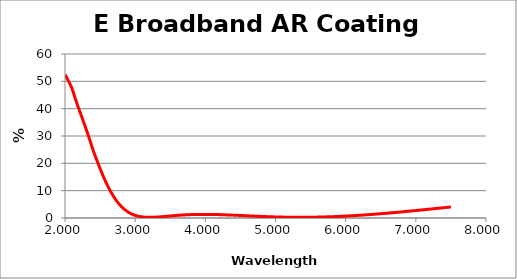
| Category | % Reflectance |
|---|---|
| 2.0 | 52.492 |
| 2.001 | 52.447 |
| 2.002 | 52.402 |
| 2.003 | 52.356 |
| 2.004 | 52.31 |
| 2.005 | 52.271 |
| 2.006 | 52.226 |
| 2.007 | 52.181 |
| 2.008 | 52.136 |
| 2.009 | 52.09 |
| 2.01 | 52.045 |
| 2.011 | 51.999 |
| 2.012 | 51.953 |
| 2.013 | 51.907 |
| 2.014 | 51.861 |
| 2.015 | 51.815 |
| 2.016 | 51.769 |
| 2.017 | 51.722 |
| 2.018 | 51.676 |
| 2.019 | 51.629 |
| 2.02 | 51.582 |
| 2.021 | 51.535 |
| 2.022 | 51.488 |
| 2.023 | 51.441 |
| 2.024 | 51.394 |
| 2.025 | 51.346 |
| 2.026 | 51.298 |
| 2.027 | 51.251 |
| 2.028 | 51.203 |
| 2.029 | 51.155 |
| 2.03 | 51.107 |
| 2.031 | 51.058 |
| 2.032 | 51.01 |
| 2.033 | 50.961 |
| 2.034 | 50.913 |
| 2.035 | 50.864 |
| 2.036 | 50.815 |
| 2.037 | 50.766 |
| 2.038 | 50.716 |
| 2.039 | 50.667 |
| 2.04 | 50.617 |
| 2.041 | 50.568 |
| 2.042 | 50.518 |
| 2.043 | 50.468 |
| 2.044 | 50.418 |
| 2.045 | 50.367 |
| 2.046 | 50.317 |
| 2.047 | 50.266 |
| 2.048 | 50.216 |
| 2.049 | 50.165 |
| 2.05 | 50.114 |
| 2.051 | 50.063 |
| 2.052 | 50.012 |
| 2.053 | 49.96 |
| 2.054 | 49.909 |
| 2.055 | 49.857 |
| 2.056 | 49.805 |
| 2.057 | 49.753 |
| 2.058 | 49.701 |
| 2.059 | 49.648 |
| 2.06 | 49.596 |
| 2.061 | 49.543 |
| 2.062 | 49.491 |
| 2.063 | 49.438 |
| 2.064 | 49.385 |
| 2.065 | 49.332 |
| 2.066 | 49.278 |
| 2.067 | 49.225 |
| 2.068 | 49.171 |
| 2.069 | 49.117 |
| 2.07 | 49.063 |
| 2.071 | 49.009 |
| 2.072 | 48.955 |
| 2.073 | 48.901 |
| 2.074 | 48.846 |
| 2.075 | 48.792 |
| 2.076 | 48.737 |
| 2.077 | 48.682 |
| 2.078 | 48.627 |
| 2.079 | 48.572 |
| 2.08 | 48.516 |
| 2.081 | 48.461 |
| 2.082 | 48.405 |
| 2.083 | 48.349 |
| 2.084 | 48.293 |
| 2.085 | 48.237 |
| 2.086 | 48.181 |
| 2.087 | 48.125 |
| 2.088 | 48.068 |
| 2.089 | 48.012 |
| 2.09 | 47.955 |
| 2.091 | 47.898 |
| 2.092 | 47.841 |
| 2.093 | 47.784 |
| 2.094 | 47.727 |
| 2.095 | 47.669 |
| 2.096 | 47.612 |
| 2.097 | 47.555 |
| 2.098 | 47.498 |
| 2.099 | 47.44 |
| 2.1 | 47.382 |
| 2.101 | 47.324 |
| 2.102 | 47.247 |
| 2.103 | 47.17 |
| 2.104 | 47.093 |
| 2.105 | 47.016 |
| 2.106 | 46.938 |
| 2.107 | 46.86 |
| 2.108 | 46.782 |
| 2.109 | 46.704 |
| 2.11 | 46.626 |
| 2.111 | 46.547 |
| 2.112 | 46.468 |
| 2.113 | 46.389 |
| 2.114 | 46.31 |
| 2.115 | 46.231 |
| 2.116 | 46.152 |
| 2.117 | 46.072 |
| 2.118 | 45.992 |
| 2.119 | 45.912 |
| 2.12 | 45.832 |
| 2.121 | 45.752 |
| 2.122 | 45.671 |
| 2.123 | 45.591 |
| 2.124 | 45.51 |
| 2.125 | 45.429 |
| 2.126 | 45.348 |
| 2.127 | 45.266 |
| 2.128 | 45.185 |
| 2.129 | 45.103 |
| 2.13 | 45.021 |
| 2.131 | 44.939 |
| 2.132 | 44.857 |
| 2.133 | 44.775 |
| 2.134 | 44.692 |
| 2.135 | 44.609 |
| 2.136 | 44.527 |
| 2.137 | 44.444 |
| 2.138 | 44.36 |
| 2.139 | 44.277 |
| 2.14 | 44.194 |
| 2.141 | 44.11 |
| 2.142 | 44.026 |
| 2.143 | 43.942 |
| 2.144 | 43.858 |
| 2.145 | 43.773 |
| 2.146 | 43.689 |
| 2.147 | 43.604 |
| 2.148 | 43.519 |
| 2.149 | 43.434 |
| 2.15 | 43.349 |
| 2.151 | 43.279 |
| 2.152 | 43.208 |
| 2.153 | 43.137 |
| 2.154 | 43.066 |
| 2.155 | 42.995 |
| 2.156 | 42.924 |
| 2.157 | 42.852 |
| 2.158 | 42.781 |
| 2.159 | 42.709 |
| 2.16 | 42.637 |
| 2.161 | 42.565 |
| 2.162 | 42.493 |
| 2.163 | 42.421 |
| 2.164 | 42.349 |
| 2.165 | 42.277 |
| 2.166 | 42.204 |
| 2.167 | 42.132 |
| 2.168 | 42.059 |
| 2.169 | 41.986 |
| 2.17 | 41.913 |
| 2.171 | 41.84 |
| 2.172 | 41.767 |
| 2.173 | 41.694 |
| 2.174 | 41.621 |
| 2.175 | 41.547 |
| 2.176 | 41.473 |
| 2.177 | 41.4 |
| 2.178 | 41.326 |
| 2.179 | 41.252 |
| 2.18 | 41.178 |
| 2.181 | 41.104 |
| 2.182 | 41.03 |
| 2.183 | 40.955 |
| 2.184 | 40.881 |
| 2.185 | 40.806 |
| 2.186 | 40.732 |
| 2.187 | 40.657 |
| 2.188 | 40.582 |
| 2.189 | 40.507 |
| 2.19 | 40.432 |
| 2.191 | 40.357 |
| 2.192 | 40.282 |
| 2.193 | 40.207 |
| 2.194 | 40.131 |
| 2.195 | 40.056 |
| 2.196 | 39.98 |
| 2.197 | 39.904 |
| 2.198 | 39.828 |
| 2.199 | 39.753 |
| 2.2 | 39.677 |
| 2.201 | 39.609 |
| 2.202 | 39.541 |
| 2.203 | 39.473 |
| 2.204 | 39.405 |
| 2.205 | 39.338 |
| 2.206 | 39.269 |
| 2.207 | 39.201 |
| 2.208 | 39.133 |
| 2.209 | 39.065 |
| 2.21 | 38.997 |
| 2.211 | 38.928 |
| 2.212 | 38.86 |
| 2.213 | 38.791 |
| 2.214 | 38.722 |
| 2.215 | 38.654 |
| 2.216 | 38.585 |
| 2.217 | 38.516 |
| 2.218 | 38.446 |
| 2.219 | 38.377 |
| 2.22 | 38.308 |
| 2.221 | 38.238 |
| 2.222 | 38.169 |
| 2.223 | 38.099 |
| 2.224 | 38.029 |
| 2.225 | 37.96 |
| 2.226 | 37.89 |
| 2.227 | 37.82 |
| 2.228 | 37.75 |
| 2.229 | 37.68 |
| 2.23 | 37.61 |
| 2.231 | 37.54 |
| 2.232 | 37.469 |
| 2.233 | 37.399 |
| 2.234 | 37.329 |
| 2.235 | 37.258 |
| 2.236 | 37.188 |
| 2.237 | 37.117 |
| 2.238 | 37.047 |
| 2.239 | 36.976 |
| 2.24 | 36.906 |
| 2.241 | 36.835 |
| 2.242 | 36.764 |
| 2.243 | 36.693 |
| 2.244 | 36.622 |
| 2.245 | 36.551 |
| 2.246 | 36.48 |
| 2.247 | 36.409 |
| 2.248 | 36.338 |
| 2.249 | 36.267 |
| 2.25 | 36.196 |
| 2.251 | 36.124 |
| 2.252 | 36.053 |
| 2.253 | 35.982 |
| 2.254 | 35.91 |
| 2.255 | 35.839 |
| 2.256 | 35.767 |
| 2.257 | 35.695 |
| 2.258 | 35.624 |
| 2.259 | 35.552 |
| 2.26 | 35.48 |
| 2.261 | 35.409 |
| 2.262 | 35.337 |
| 2.263 | 35.265 |
| 2.264 | 35.193 |
| 2.265 | 35.121 |
| 2.266 | 35.049 |
| 2.267 | 34.977 |
| 2.268 | 34.905 |
| 2.269 | 34.833 |
| 2.27 | 34.761 |
| 2.271 | 34.689 |
| 2.272 | 34.616 |
| 2.273 | 34.544 |
| 2.274 | 34.472 |
| 2.275 | 34.399 |
| 2.276 | 34.327 |
| 2.277 | 34.255 |
| 2.278 | 34.182 |
| 2.279 | 34.11 |
| 2.28 | 34.037 |
| 2.281 | 33.965 |
| 2.282 | 33.892 |
| 2.283 | 33.82 |
| 2.284 | 33.747 |
| 2.285 | 33.674 |
| 2.286 | 33.602 |
| 2.287 | 33.529 |
| 2.288 | 33.456 |
| 2.289 | 33.383 |
| 2.29 | 33.311 |
| 2.291 | 33.238 |
| 2.292 | 33.165 |
| 2.293 | 33.092 |
| 2.294 | 33.019 |
| 2.295 | 32.946 |
| 2.296 | 32.874 |
| 2.297 | 32.801 |
| 2.298 | 32.728 |
| 2.299 | 32.655 |
| 2.3 | 32.582 |
| 2.301 | 32.506 |
| 2.302 | 32.431 |
| 2.303 | 32.356 |
| 2.304 | 32.281 |
| 2.305 | 32.205 |
| 2.306 | 32.13 |
| 2.307 | 32.055 |
| 2.308 | 31.979 |
| 2.309 | 31.904 |
| 2.31 | 31.829 |
| 2.311 | 31.753 |
| 2.312 | 31.678 |
| 2.313 | 31.602 |
| 2.314 | 31.527 |
| 2.315 | 31.452 |
| 2.316 | 31.376 |
| 2.317 | 31.301 |
| 2.318 | 31.225 |
| 2.319 | 31.15 |
| 2.32 | 31.074 |
| 2.321 | 30.999 |
| 2.322 | 30.923 |
| 2.323 | 30.848 |
| 2.324 | 30.772 |
| 2.325 | 30.697 |
| 2.326 | 30.622 |
| 2.327 | 30.546 |
| 2.328 | 30.471 |
| 2.329 | 30.395 |
| 2.33 | 30.32 |
| 2.331 | 30.244 |
| 2.332 | 30.169 |
| 2.333 | 30.093 |
| 2.334 | 30.018 |
| 2.335 | 29.942 |
| 2.336 | 29.867 |
| 2.337 | 29.792 |
| 2.338 | 29.716 |
| 2.339 | 29.641 |
| 2.34 | 29.565 |
| 2.341 | 29.49 |
| 2.342 | 29.415 |
| 2.343 | 29.339 |
| 2.344 | 29.264 |
| 2.345 | 29.188 |
| 2.346 | 29.113 |
| 2.347 | 29.038 |
| 2.348 | 28.962 |
| 2.349 | 28.887 |
| 2.35 | 28.812 |
| 2.351 | 28.732 |
| 2.352 | 28.652 |
| 2.353 | 28.572 |
| 2.354 | 28.492 |
| 2.355 | 28.412 |
| 2.356 | 28.333 |
| 2.357 | 28.253 |
| 2.358 | 28.173 |
| 2.359 | 28.093 |
| 2.36 | 28.014 |
| 2.361 | 27.934 |
| 2.362 | 27.854 |
| 2.363 | 27.775 |
| 2.364 | 27.695 |
| 2.365 | 27.615 |
| 2.366 | 27.536 |
| 2.367 | 27.456 |
| 2.368 | 27.377 |
| 2.369 | 27.297 |
| 2.37 | 27.218 |
| 2.371 | 27.139 |
| 2.372 | 27.059 |
| 2.373 | 26.98 |
| 2.374 | 26.901 |
| 2.375 | 26.821 |
| 2.376 | 26.742 |
| 2.377 | 26.663 |
| 2.378 | 26.584 |
| 2.379 | 26.505 |
| 2.38 | 26.426 |
| 2.381 | 26.347 |
| 2.382 | 26.268 |
| 2.383 | 26.189 |
| 2.384 | 26.11 |
| 2.385 | 26.031 |
| 2.386 | 25.953 |
| 2.387 | 25.874 |
| 2.388 | 25.795 |
| 2.389 | 25.717 |
| 2.39 | 25.638 |
| 2.391 | 25.559 |
| 2.392 | 25.481 |
| 2.393 | 25.403 |
| 2.394 | 25.324 |
| 2.395 | 25.246 |
| 2.396 | 25.168 |
| 2.397 | 25.089 |
| 2.398 | 25.011 |
| 2.399 | 24.933 |
| 2.4 | 24.855 |
| 2.401 | 24.784 |
| 2.402 | 24.714 |
| 2.403 | 24.643 |
| 2.404 | 24.572 |
| 2.405 | 24.502 |
| 2.406 | 24.431 |
| 2.407 | 24.361 |
| 2.408 | 24.29 |
| 2.409 | 24.22 |
| 2.41 | 24.149 |
| 2.411 | 24.079 |
| 2.412 | 24.009 |
| 2.413 | 23.939 |
| 2.414 | 23.868 |
| 2.415 | 23.798 |
| 2.416 | 23.728 |
| 2.417 | 23.658 |
| 2.418 | 23.588 |
| 2.419 | 23.519 |
| 2.42 | 23.449 |
| 2.421 | 23.379 |
| 2.422 | 23.309 |
| 2.423 | 23.24 |
| 2.424 | 23.17 |
| 2.425 | 23.101 |
| 2.426 | 23.031 |
| 2.427 | 22.962 |
| 2.428 | 22.893 |
| 2.429 | 22.824 |
| 2.43 | 22.754 |
| 2.431 | 22.685 |
| 2.432 | 22.616 |
| 2.433 | 22.547 |
| 2.434 | 22.478 |
| 2.435 | 22.41 |
| 2.436 | 22.341 |
| 2.437 | 22.272 |
| 2.438 | 22.204 |
| 2.439 | 22.135 |
| 2.44 | 22.067 |
| 2.441 | 21.998 |
| 2.442 | 21.93 |
| 2.443 | 21.862 |
| 2.444 | 21.793 |
| 2.445 | 21.725 |
| 2.446 | 21.657 |
| 2.447 | 21.589 |
| 2.448 | 21.521 |
| 2.449 | 21.454 |
| 2.45 | 21.386 |
| 2.451 | 21.318 |
| 2.452 | 21.251 |
| 2.453 | 21.183 |
| 2.454 | 21.116 |
| 2.455 | 21.048 |
| 2.456 | 20.981 |
| 2.457 | 20.914 |
| 2.458 | 20.847 |
| 2.459 | 20.78 |
| 2.46 | 20.713 |
| 2.461 | 20.646 |
| 2.462 | 20.579 |
| 2.463 | 20.513 |
| 2.464 | 20.446 |
| 2.465 | 20.38 |
| 2.466 | 20.313 |
| 2.467 | 20.247 |
| 2.468 | 20.18 |
| 2.469 | 20.114 |
| 2.47 | 20.048 |
| 2.471 | 19.982 |
| 2.472 | 19.916 |
| 2.473 | 19.85 |
| 2.474 | 19.785 |
| 2.475 | 19.719 |
| 2.476 | 19.653 |
| 2.477 | 19.588 |
| 2.478 | 19.522 |
| 2.479 | 19.457 |
| 2.48 | 19.392 |
| 2.481 | 19.327 |
| 2.482 | 19.262 |
| 2.483 | 19.197 |
| 2.484 | 19.132 |
| 2.485 | 19.067 |
| 2.486 | 19.003 |
| 2.487 | 18.938 |
| 2.488 | 18.874 |
| 2.489 | 18.809 |
| 2.49 | 18.745 |
| 2.491 | 18.681 |
| 2.492 | 18.617 |
| 2.493 | 18.553 |
| 2.494 | 18.489 |
| 2.495 | 18.425 |
| 2.496 | 18.361 |
| 2.497 | 18.298 |
| 2.498 | 18.234 |
| 2.499 | 18.171 |
| 2.5 | 18.107 |
| 2.501 | 18.042 |
| 2.502 | 17.978 |
| 2.503 | 17.913 |
| 2.504 | 17.849 |
| 2.505 | 17.784 |
| 2.506 | 17.72 |
| 2.507 | 17.656 |
| 2.508 | 17.591 |
| 2.509 | 17.527 |
| 2.51 | 17.463 |
| 2.511 | 17.4 |
| 2.512 | 17.336 |
| 2.513 | 17.272 |
| 2.514 | 17.209 |
| 2.515 | 17.146 |
| 2.516 | 17.082 |
| 2.517 | 17.019 |
| 2.518 | 16.956 |
| 2.519 | 16.893 |
| 2.52 | 16.83 |
| 2.521 | 16.768 |
| 2.522 | 16.705 |
| 2.523 | 16.643 |
| 2.524 | 16.58 |
| 2.525 | 16.518 |
| 2.526 | 16.456 |
| 2.527 | 16.394 |
| 2.528 | 16.332 |
| 2.529 | 16.27 |
| 2.53 | 16.209 |
| 2.531 | 16.147 |
| 2.532 | 16.086 |
| 2.533 | 16.024 |
| 2.534 | 15.963 |
| 2.535 | 15.902 |
| 2.536 | 15.841 |
| 2.537 | 15.78 |
| 2.538 | 15.719 |
| 2.539 | 15.659 |
| 2.54 | 15.598 |
| 2.541 | 15.538 |
| 2.542 | 15.478 |
| 2.543 | 15.417 |
| 2.544 | 15.357 |
| 2.545 | 15.298 |
| 2.546 | 15.238 |
| 2.547 | 15.178 |
| 2.548 | 15.118 |
| 2.549 | 15.059 |
| 2.55 | 14.999 |
| 2.551 | 14.94 |
| 2.552 | 14.881 |
| 2.553 | 14.822 |
| 2.554 | 14.763 |
| 2.555 | 14.704 |
| 2.556 | 14.645 |
| 2.557 | 14.587 |
| 2.558 | 14.528 |
| 2.559 | 14.47 |
| 2.56 | 14.412 |
| 2.561 | 14.354 |
| 2.562 | 14.296 |
| 2.563 | 14.238 |
| 2.564 | 14.181 |
| 2.565 | 14.123 |
| 2.566 | 14.066 |
| 2.567 | 14.008 |
| 2.568 | 13.951 |
| 2.569 | 13.894 |
| 2.57 | 13.837 |
| 2.571 | 13.78 |
| 2.572 | 13.724 |
| 2.573 | 13.667 |
| 2.574 | 13.611 |
| 2.575 | 13.554 |
| 2.576 | 13.498 |
| 2.577 | 13.442 |
| 2.578 | 13.386 |
| 2.579 | 13.331 |
| 2.58 | 13.275 |
| 2.581 | 13.219 |
| 2.582 | 13.164 |
| 2.583 | 13.109 |
| 2.584 | 13.054 |
| 2.585 | 12.999 |
| 2.586 | 12.944 |
| 2.587 | 12.889 |
| 2.588 | 12.834 |
| 2.589 | 12.78 |
| 2.59 | 12.726 |
| 2.591 | 12.671 |
| 2.592 | 12.617 |
| 2.593 | 12.563 |
| 2.594 | 12.509 |
| 2.595 | 12.456 |
| 2.596 | 12.402 |
| 2.597 | 12.349 |
| 2.598 | 12.296 |
| 2.599 | 12.242 |
| 2.6 | 12.189 |
| 2.601 | 12.137 |
| 2.602 | 12.084 |
| 2.603 | 12.032 |
| 2.604 | 11.979 |
| 2.605 | 11.927 |
| 2.606 | 11.875 |
| 2.607 | 11.823 |
| 2.608 | 11.772 |
| 2.609 | 11.72 |
| 2.61 | 11.669 |
| 2.611 | 11.617 |
| 2.612 | 11.566 |
| 2.613 | 11.515 |
| 2.614 | 11.464 |
| 2.615 | 11.413 |
| 2.616 | 11.363 |
| 2.617 | 11.312 |
| 2.618 | 11.262 |
| 2.619 | 11.211 |
| 2.62 | 11.161 |
| 2.621 | 11.111 |
| 2.622 | 11.061 |
| 2.623 | 11.012 |
| 2.624 | 10.962 |
| 2.625 | 10.913 |
| 2.626 | 10.863 |
| 2.627 | 10.814 |
| 2.628 | 10.765 |
| 2.629 | 10.716 |
| 2.63 | 10.667 |
| 2.631 | 10.619 |
| 2.632 | 10.57 |
| 2.633 | 10.522 |
| 2.634 | 10.474 |
| 2.635 | 10.425 |
| 2.636 | 10.377 |
| 2.637 | 10.329 |
| 2.638 | 10.282 |
| 2.639 | 10.234 |
| 2.64 | 10.186 |
| 2.641 | 10.139 |
| 2.642 | 10.092 |
| 2.643 | 10.044 |
| 2.644 | 9.997 |
| 2.645 | 9.951 |
| 2.646 | 9.904 |
| 2.647 | 9.857 |
| 2.648 | 9.811 |
| 2.649 | 9.764 |
| 2.65 | 9.718 |
| 2.651 | 9.672 |
| 2.652 | 9.626 |
| 2.653 | 9.58 |
| 2.654 | 9.535 |
| 2.655 | 9.489 |
| 2.656 | 9.444 |
| 2.657 | 9.398 |
| 2.658 | 9.353 |
| 2.659 | 9.308 |
| 2.66 | 9.264 |
| 2.661 | 9.219 |
| 2.662 | 9.174 |
| 2.663 | 9.13 |
| 2.664 | 9.086 |
| 2.665 | 9.041 |
| 2.666 | 8.997 |
| 2.667 | 8.953 |
| 2.668 | 8.91 |
| 2.669 | 8.866 |
| 2.67 | 8.823 |
| 2.671 | 8.779 |
| 2.672 | 8.736 |
| 2.673 | 8.693 |
| 2.674 | 8.65 |
| 2.675 | 8.607 |
| 2.676 | 8.564 |
| 2.677 | 8.522 |
| 2.678 | 8.48 |
| 2.679 | 8.437 |
| 2.68 | 8.395 |
| 2.681 | 8.353 |
| 2.682 | 8.311 |
| 2.683 | 8.27 |
| 2.684 | 8.228 |
| 2.685 | 8.187 |
| 2.686 | 8.145 |
| 2.687 | 8.104 |
| 2.688 | 8.063 |
| 2.689 | 8.022 |
| 2.69 | 7.981 |
| 2.691 | 7.941 |
| 2.692 | 7.9 |
| 2.693 | 7.86 |
| 2.694 | 7.82 |
| 2.695 | 7.78 |
| 2.696 | 7.74 |
| 2.697 | 7.7 |
| 2.698 | 7.66 |
| 2.699 | 7.62 |
| 2.7 | 7.581 |
| 2.701 | 7.542 |
| 2.702 | 7.503 |
| 2.703 | 7.464 |
| 2.704 | 7.425 |
| 2.705 | 7.386 |
| 2.706 | 7.347 |
| 2.707 | 7.309 |
| 2.708 | 7.27 |
| 2.709 | 7.232 |
| 2.71 | 7.194 |
| 2.711 | 7.156 |
| 2.712 | 7.118 |
| 2.713 | 7.081 |
| 2.714 | 7.043 |
| 2.715 | 7.006 |
| 2.716 | 6.968 |
| 2.717 | 6.931 |
| 2.718 | 6.894 |
| 2.719 | 6.857 |
| 2.72 | 6.821 |
| 2.721 | 6.784 |
| 2.722 | 6.747 |
| 2.723 | 6.711 |
| 2.724 | 6.675 |
| 2.725 | 6.639 |
| 2.726 | 6.603 |
| 2.727 | 6.567 |
| 2.728 | 6.531 |
| 2.729 | 6.496 |
| 2.73 | 6.46 |
| 2.731 | 6.425 |
| 2.732 | 6.39 |
| 2.733 | 6.355 |
| 2.734 | 6.32 |
| 2.735 | 6.285 |
| 2.736 | 6.25 |
| 2.737 | 6.216 |
| 2.738 | 6.181 |
| 2.739 | 6.147 |
| 2.74 | 6.113 |
| 2.741 | 6.079 |
| 2.742 | 6.045 |
| 2.743 | 6.011 |
| 2.744 | 5.978 |
| 2.745 | 5.944 |
| 2.746 | 5.911 |
| 2.747 | 5.878 |
| 2.748 | 5.844 |
| 2.749 | 5.811 |
| 2.75 | 5.779 |
| 2.751 | 5.746 |
| 2.752 | 5.713 |
| 2.753 | 5.681 |
| 2.754 | 5.648 |
| 2.755 | 5.616 |
| 2.756 | 5.584 |
| 2.757 | 5.552 |
| 2.758 | 5.52 |
| 2.759 | 5.489 |
| 2.76 | 5.457 |
| 2.761 | 5.425 |
| 2.762 | 5.394 |
| 2.763 | 5.363 |
| 2.764 | 5.332 |
| 2.765 | 5.301 |
| 2.766 | 5.27 |
| 2.767 | 5.239 |
| 2.768 | 5.209 |
| 2.769 | 5.178 |
| 2.77 | 5.148 |
| 2.771 | 5.118 |
| 2.772 | 5.088 |
| 2.773 | 5.058 |
| 2.774 | 5.028 |
| 2.775 | 4.998 |
| 2.776 | 4.968 |
| 2.777 | 4.939 |
| 2.778 | 4.91 |
| 2.779 | 4.88 |
| 2.78 | 4.851 |
| 2.781 | 4.822 |
| 2.782 | 4.793 |
| 2.783 | 4.765 |
| 2.784 | 4.736 |
| 2.785 | 4.707 |
| 2.786 | 4.679 |
| 2.787 | 4.651 |
| 2.788 | 4.623 |
| 2.789 | 4.595 |
| 2.79 | 4.567 |
| 2.791 | 4.539 |
| 2.792 | 4.511 |
| 2.793 | 4.484 |
| 2.794 | 4.456 |
| 2.795 | 4.429 |
| 2.796 | 4.402 |
| 2.797 | 4.375 |
| 2.798 | 4.348 |
| 2.799 | 4.321 |
| 2.8 | 4.294 |
| 2.801 | 4.268 |
| 2.802 | 4.241 |
| 2.803 | 4.215 |
| 2.804 | 4.188 |
| 2.805 | 4.162 |
| 2.806 | 4.136 |
| 2.807 | 4.11 |
| 2.808 | 4.085 |
| 2.809 | 4.059 |
| 2.81 | 4.033 |
| 2.811 | 4.008 |
| 2.812 | 3.983 |
| 2.813 | 3.957 |
| 2.814 | 3.932 |
| 2.815 | 3.907 |
| 2.816 | 3.882 |
| 2.817 | 3.858 |
| 2.818 | 3.833 |
| 2.819 | 3.808 |
| 2.82 | 3.784 |
| 2.821 | 3.76 |
| 2.822 | 3.736 |
| 2.823 | 3.711 |
| 2.824 | 3.687 |
| 2.825 | 3.664 |
| 2.826 | 3.64 |
| 2.827 | 3.616 |
| 2.828 | 3.593 |
| 2.829 | 3.569 |
| 2.83 | 3.546 |
| 2.831 | 3.523 |
| 2.832 | 3.5 |
| 2.833 | 3.477 |
| 2.834 | 3.454 |
| 2.835 | 3.431 |
| 2.836 | 3.408 |
| 2.837 | 3.386 |
| 2.838 | 3.363 |
| 2.839 | 3.341 |
| 2.84 | 3.319 |
| 2.841 | 3.297 |
| 2.842 | 3.275 |
| 2.843 | 3.253 |
| 2.844 | 3.231 |
| 2.845 | 3.209 |
| 2.846 | 3.188 |
| 2.847 | 3.166 |
| 2.848 | 3.145 |
| 2.849 | 3.124 |
| 2.85 | 3.103 |
| 2.851 | 3.081 |
| 2.852 | 3.061 |
| 2.853 | 3.04 |
| 2.854 | 3.019 |
| 2.855 | 2.998 |
| 2.856 | 2.978 |
| 2.857 | 2.957 |
| 2.858 | 2.937 |
| 2.859 | 2.917 |
| 2.86 | 2.897 |
| 2.861 | 2.877 |
| 2.862 | 2.857 |
| 2.863 | 2.837 |
| 2.864 | 2.817 |
| 2.865 | 2.798 |
| 2.866 | 2.778 |
| 2.867 | 2.759 |
| 2.868 | 2.739 |
| 2.869 | 2.72 |
| 2.87 | 2.701 |
| 2.871 | 2.682 |
| 2.872 | 2.663 |
| 2.873 | 2.644 |
| 2.874 | 2.626 |
| 2.875 | 2.607 |
| 2.876 | 2.588 |
| 2.877 | 2.57 |
| 2.878 | 2.552 |
| 2.879 | 2.534 |
| 2.88 | 2.515 |
| 2.881 | 2.497 |
| 2.882 | 2.479 |
| 2.883 | 2.462 |
| 2.884 | 2.444 |
| 2.885 | 2.426 |
| 2.886 | 2.409 |
| 2.887 | 2.391 |
| 2.888 | 2.374 |
| 2.889 | 2.357 |
| 2.89 | 2.339 |
| 2.891 | 2.322 |
| 2.892 | 2.305 |
| 2.893 | 2.288 |
| 2.894 | 2.272 |
| 2.895 | 2.255 |
| 2.896 | 2.238 |
| 2.897 | 2.222 |
| 2.898 | 2.205 |
| 2.899 | 2.189 |
| 2.9 | 2.173 |
| 2.901 | 2.157 |
| 2.902 | 2.141 |
| 2.903 | 2.125 |
| 2.904 | 2.109 |
| 2.905 | 2.093 |
| 2.906 | 2.077 |
| 2.907 | 2.062 |
| 2.908 | 2.046 |
| 2.909 | 2.031 |
| 2.91 | 2.015 |
| 2.911 | 2 |
| 2.912 | 1.985 |
| 2.913 | 1.97 |
| 2.914 | 1.955 |
| 2.915 | 1.94 |
| 2.916 | 1.925 |
| 2.917 | 1.91 |
| 2.918 | 1.896 |
| 2.919 | 1.881 |
| 2.92 | 1.867 |
| 2.921 | 1.852 |
| 2.922 | 1.838 |
| 2.923 | 1.824 |
| 2.924 | 1.81 |
| 2.925 | 1.796 |
| 2.926 | 1.782 |
| 2.927 | 1.768 |
| 2.928 | 1.754 |
| 2.929 | 1.74 |
| 2.93 | 1.726 |
| 2.931 | 1.713 |
| 2.932 | 1.699 |
| 2.933 | 1.686 |
| 2.934 | 1.673 |
| 2.935 | 1.659 |
| 2.936 | 1.646 |
| 2.937 | 1.633 |
| 2.938 | 1.62 |
| 2.939 | 1.607 |
| 2.94 | 1.594 |
| 2.941 | 1.582 |
| 2.942 | 1.569 |
| 2.943 | 1.556 |
| 2.944 | 1.544 |
| 2.945 | 1.531 |
| 2.946 | 1.519 |
| 2.947 | 1.507 |
| 2.948 | 1.494 |
| 2.949 | 1.482 |
| 2.95 | 1.47 |
| 2.951 | 1.458 |
| 2.952 | 1.446 |
| 2.953 | 1.435 |
| 2.954 | 1.423 |
| 2.955 | 1.411 |
| 2.956 | 1.4 |
| 2.957 | 1.388 |
| 2.958 | 1.377 |
| 2.959 | 1.365 |
| 2.96 | 1.354 |
| 2.961 | 1.343 |
| 2.962 | 1.332 |
| 2.963 | 1.321 |
| 2.964 | 1.31 |
| 2.965 | 1.299 |
| 2.966 | 1.288 |
| 2.967 | 1.277 |
| 2.968 | 1.266 |
| 2.969 | 1.256 |
| 2.97 | 1.245 |
| 2.971 | 1.235 |
| 2.972 | 1.224 |
| 2.973 | 1.214 |
| 2.974 | 1.204 |
| 2.975 | 1.194 |
| 2.976 | 1.184 |
| 2.977 | 1.174 |
| 2.978 | 1.164 |
| 2.979 | 1.154 |
| 2.98 | 1.144 |
| 2.981 | 1.134 |
| 2.982 | 1.124 |
| 2.983 | 1.115 |
| 2.984 | 1.105 |
| 2.985 | 1.096 |
| 2.986 | 1.086 |
| 2.987 | 1.077 |
| 2.988 | 1.068 |
| 2.989 | 1.058 |
| 2.99 | 1.049 |
| 2.991 | 1.04 |
| 2.992 | 1.031 |
| 2.993 | 1.022 |
| 2.994 | 1.013 |
| 2.995 | 1.005 |
| 2.996 | 0.996 |
| 2.997 | 0.987 |
| 2.998 | 0.979 |
| 2.999 | 0.97 |
| 3.0 | 0.962 |
| 3.001 | 0.953 |
| 3.002 | 0.945 |
| 3.003 | 0.937 |
| 3.004 | 0.929 |
| 3.005 | 0.921 |
| 3.006 | 0.913 |
| 3.007 | 0.906 |
| 3.008 | 0.898 |
| 3.009 | 0.89 |
| 3.01 | 0.883 |
| 3.011 | 0.875 |
| 3.012 | 0.867 |
| 3.013 | 0.86 |
| 3.014 | 0.853 |
| 3.015 | 0.845 |
| 3.016 | 0.838 |
| 3.017 | 0.831 |
| 3.018 | 0.824 |
| 3.019 | 0.816 |
| 3.02 | 0.809 |
| 3.021 | 0.802 |
| 3.022 | 0.796 |
| 3.023 | 0.789 |
| 3.024 | 0.782 |
| 3.025 | 0.775 |
| 3.026 | 0.768 |
| 3.027 | 0.762 |
| 3.028 | 0.755 |
| 3.029 | 0.748 |
| 3.03 | 0.742 |
| 3.031 | 0.735 |
| 3.032 | 0.729 |
| 3.033 | 0.723 |
| 3.034 | 0.716 |
| 3.035 | 0.71 |
| 3.036 | 0.704 |
| 3.037 | 0.697 |
| 3.038 | 0.691 |
| 3.039 | 0.685 |
| 3.04 | 0.679 |
| 3.041 | 0.673 |
| 3.042 | 0.667 |
| 3.043 | 0.661 |
| 3.044 | 0.656 |
| 3.045 | 0.65 |
| 3.046 | 0.644 |
| 3.047 | 0.639 |
| 3.048 | 0.633 |
| 3.049 | 0.627 |
| 3.05 | 0.622 |
| 3.051 | 0.616 |
| 3.052 | 0.611 |
| 3.053 | 0.606 |
| 3.054 | 0.6 |
| 3.055 | 0.595 |
| 3.056 | 0.59 |
| 3.057 | 0.585 |
| 3.058 | 0.58 |
| 3.059 | 0.574 |
| 3.06 | 0.569 |
| 3.061 | 0.565 |
| 3.062 | 0.56 |
| 3.063 | 0.555 |
| 3.064 | 0.55 |
| 3.065 | 0.545 |
| 3.066 | 0.54 |
| 3.067 | 0.536 |
| 3.068 | 0.531 |
| 3.069 | 0.526 |
| 3.07 | 0.522 |
| 3.071 | 0.517 |
| 3.072 | 0.513 |
| 3.073 | 0.509 |
| 3.074 | 0.504 |
| 3.075 | 0.5 |
| 3.076 | 0.496 |
| 3.077 | 0.491 |
| 3.078 | 0.487 |
| 3.079 | 0.483 |
| 3.08 | 0.479 |
| 3.081 | 0.475 |
| 3.082 | 0.471 |
| 3.083 | 0.467 |
| 3.084 | 0.463 |
| 3.085 | 0.459 |
| 3.086 | 0.455 |
| 3.087 | 0.452 |
| 3.088 | 0.448 |
| 3.089 | 0.444 |
| 3.09 | 0.44 |
| 3.091 | 0.437 |
| 3.092 | 0.433 |
| 3.093 | 0.43 |
| 3.094 | 0.426 |
| 3.095 | 0.423 |
| 3.096 | 0.419 |
| 3.097 | 0.416 |
| 3.098 | 0.413 |
| 3.099 | 0.409 |
| 3.1 | 0.406 |
| 3.101 | 0.403 |
| 3.102 | 0.4 |
| 3.103 | 0.397 |
| 3.104 | 0.393 |
| 3.105 | 0.39 |
| 3.106 | 0.387 |
| 3.107 | 0.384 |
| 3.108 | 0.381 |
| 3.109 | 0.379 |
| 3.11 | 0.376 |
| 3.111 | 0.373 |
| 3.112 | 0.37 |
| 3.113 | 0.367 |
| 3.114 | 0.365 |
| 3.115 | 0.362 |
| 3.116 | 0.359 |
| 3.117 | 0.357 |
| 3.118 | 0.354 |
| 3.119 | 0.352 |
| 3.12 | 0.349 |
| 3.121 | 0.347 |
| 3.122 | 0.344 |
| 3.123 | 0.342 |
| 3.124 | 0.339 |
| 3.125 | 0.337 |
| 3.126 | 0.335 |
| 3.127 | 0.333 |
| 3.128 | 0.33 |
| 3.129 | 0.328 |
| 3.13 | 0.326 |
| 3.131 | 0.324 |
| 3.132 | 0.322 |
| 3.133 | 0.32 |
| 3.134 | 0.318 |
| 3.135 | 0.316 |
| 3.136 | 0.314 |
| 3.137 | 0.312 |
| 3.138 | 0.31 |
| 3.139 | 0.308 |
| 3.14 | 0.307 |
| 3.141 | 0.305 |
| 3.142 | 0.303 |
| 3.143 | 0.301 |
| 3.144 | 0.3 |
| 3.145 | 0.298 |
| 3.146 | 0.296 |
| 3.147 | 0.295 |
| 3.148 | 0.293 |
| 3.149 | 0.292 |
| 3.15 | 0.29 |
| 3.151 | 0.289 |
| 3.152 | 0.287 |
| 3.153 | 0.286 |
| 3.154 | 0.285 |
| 3.155 | 0.283 |
| 3.156 | 0.282 |
| 3.157 | 0.281 |
| 3.158 | 0.279 |
| 3.159 | 0.278 |
| 3.16 | 0.277 |
| 3.161 | 0.276 |
| 3.162 | 0.275 |
| 3.163 | 0.274 |
| 3.164 | 0.273 |
| 3.165 | 0.271 |
| 3.166 | 0.27 |
| 3.167 | 0.269 |
| 3.168 | 0.268 |
| 3.169 | 0.268 |
| 3.17 | 0.267 |
| 3.171 | 0.266 |
| 3.172 | 0.265 |
| 3.173 | 0.264 |
| 3.174 | 0.263 |
| 3.175 | 0.263 |
| 3.176 | 0.262 |
| 3.177 | 0.261 |
| 3.178 | 0.26 |
| 3.179 | 0.26 |
| 3.18 | 0.259 |
| 3.181 | 0.258 |
| 3.182 | 0.258 |
| 3.183 | 0.257 |
| 3.184 | 0.257 |
| 3.185 | 0.256 |
| 3.186 | 0.256 |
| 3.187 | 0.255 |
| 3.188 | 0.255 |
| 3.189 | 0.254 |
| 3.19 | 0.254 |
| 3.191 | 0.254 |
| 3.192 | 0.253 |
| 3.193 | 0.253 |
| 3.194 | 0.253 |
| 3.195 | 0.252 |
| 3.196 | 0.252 |
| 3.197 | 0.252 |
| 3.198 | 0.252 |
| 3.199 | 0.252 |
| 3.2 | 0.252 |
| 3.201 | 0.251 |
| 3.202 | 0.251 |
| 3.203 | 0.251 |
| 3.204 | 0.251 |
| 3.205 | 0.251 |
| 3.206 | 0.251 |
| 3.207 | 0.251 |
| 3.208 | 0.251 |
| 3.209 | 0.251 |
| 3.21 | 0.251 |
| 3.211 | 0.251 |
| 3.212 | 0.251 |
| 3.213 | 0.252 |
| 3.214 | 0.252 |
| 3.215 | 0.252 |
| 3.216 | 0.252 |
| 3.217 | 0.252 |
| 3.218 | 0.253 |
| 3.219 | 0.253 |
| 3.22 | 0.253 |
| 3.221 | 0.253 |
| 3.222 | 0.254 |
| 3.223 | 0.254 |
| 3.224 | 0.254 |
| 3.225 | 0.255 |
| 3.226 | 0.255 |
| 3.227 | 0.256 |
| 3.228 | 0.256 |
| 3.229 | 0.257 |
| 3.23 | 0.257 |
| 3.231 | 0.258 |
| 3.232 | 0.258 |
| 3.233 | 0.259 |
| 3.234 | 0.259 |
| 3.235 | 0.26 |
| 3.236 | 0.26 |
| 3.237 | 0.261 |
| 3.238 | 0.262 |
| 3.239 | 0.262 |
| 3.24 | 0.263 |
| 3.241 | 0.263 |
| 3.242 | 0.264 |
| 3.243 | 0.265 |
| 3.244 | 0.266 |
| 3.245 | 0.266 |
| 3.246 | 0.267 |
| 3.247 | 0.268 |
| 3.248 | 0.269 |
| 3.249 | 0.27 |
| 3.25 | 0.27 |
| 3.251 | 0.271 |
| 3.252 | 0.272 |
| 3.253 | 0.273 |
| 3.254 | 0.274 |
| 3.255 | 0.275 |
| 3.256 | 0.276 |
| 3.257 | 0.277 |
| 3.258 | 0.278 |
| 3.259 | 0.279 |
| 3.26 | 0.28 |
| 3.261 | 0.281 |
| 3.262 | 0.282 |
| 3.263 | 0.283 |
| 3.264 | 0.284 |
| 3.265 | 0.285 |
| 3.266 | 0.286 |
| 3.267 | 0.287 |
| 3.268 | 0.288 |
| 3.269 | 0.289 |
| 3.27 | 0.29 |
| 3.271 | 0.291 |
| 3.272 | 0.293 |
| 3.273 | 0.294 |
| 3.274 | 0.295 |
| 3.275 | 0.296 |
| 3.276 | 0.297 |
| 3.277 | 0.299 |
| 3.278 | 0.3 |
| 3.279 | 0.301 |
| 3.28 | 0.302 |
| 3.281 | 0.304 |
| 3.282 | 0.305 |
| 3.283 | 0.306 |
| 3.284 | 0.308 |
| 3.285 | 0.309 |
| 3.286 | 0.31 |
| 3.287 | 0.312 |
| 3.288 | 0.313 |
| 3.289 | 0.314 |
| 3.29 | 0.316 |
| 3.291 | 0.317 |
| 3.292 | 0.319 |
| 3.293 | 0.32 |
| 3.294 | 0.322 |
| 3.295 | 0.323 |
| 3.296 | 0.324 |
| 3.297 | 0.326 |
| 3.298 | 0.327 |
| 3.299 | 0.329 |
| 3.3 | 0.33 |
| 3.301 | 0.332 |
| 3.302 | 0.334 |
| 3.303 | 0.335 |
| 3.304 | 0.337 |
| 3.305 | 0.338 |
| 3.306 | 0.34 |
| 3.307 | 0.341 |
| 3.308 | 0.343 |
| 3.309 | 0.345 |
| 3.31 | 0.346 |
| 3.311 | 0.348 |
| 3.312 | 0.349 |
| 3.313 | 0.351 |
| 3.314 | 0.353 |
| 3.315 | 0.354 |
| 3.316 | 0.356 |
| 3.317 | 0.358 |
| 3.318 | 0.359 |
| 3.319 | 0.361 |
| 3.32 | 0.363 |
| 3.321 | 0.365 |
| 3.322 | 0.366 |
| 3.323 | 0.368 |
| 3.324 | 0.37 |
| 3.325 | 0.372 |
| 3.326 | 0.373 |
| 3.327 | 0.375 |
| 3.328 | 0.377 |
| 3.329 | 0.379 |
| 3.33 | 0.381 |
| 3.331 | 0.382 |
| 3.332 | 0.384 |
| 3.333 | 0.386 |
| 3.334 | 0.388 |
| 3.335 | 0.39 |
| 3.336 | 0.392 |
| 3.337 | 0.393 |
| 3.338 | 0.395 |
| 3.339 | 0.397 |
| 3.34 | 0.399 |
| 3.341 | 0.401 |
| 3.342 | 0.403 |
| 3.343 | 0.405 |
| 3.344 | 0.407 |
| 3.345 | 0.409 |
| 3.346 | 0.411 |
| 3.347 | 0.412 |
| 3.348 | 0.414 |
| 3.349 | 0.416 |
| 3.35 | 0.418 |
| 3.351 | 0.42 |
| 3.352 | 0.422 |
| 3.353 | 0.424 |
| 3.354 | 0.426 |
| 3.355 | 0.428 |
| 3.356 | 0.43 |
| 3.357 | 0.432 |
| 3.358 | 0.434 |
| 3.359 | 0.436 |
| 3.36 | 0.438 |
| 3.361 | 0.44 |
| 3.362 | 0.442 |
| 3.363 | 0.444 |
| 3.364 | 0.446 |
| 3.365 | 0.448 |
| 3.366 | 0.45 |
| 3.367 | 0.452 |
| 3.368 | 0.454 |
| 3.369 | 0.457 |
| 3.37 | 0.459 |
| 3.371 | 0.461 |
| 3.372 | 0.463 |
| 3.373 | 0.465 |
| 3.374 | 0.467 |
| 3.375 | 0.469 |
| 3.376 | 0.471 |
| 3.377 | 0.473 |
| 3.378 | 0.475 |
| 3.379 | 0.477 |
| 3.38 | 0.479 |
| 3.381 | 0.482 |
| 3.382 | 0.484 |
| 3.383 | 0.486 |
| 3.384 | 0.488 |
| 3.385 | 0.49 |
| 3.386 | 0.492 |
| 3.387 | 0.494 |
| 3.388 | 0.496 |
| 3.389 | 0.499 |
| 3.39 | 0.501 |
| 3.391 | 0.503 |
| 3.392 | 0.505 |
| 3.393 | 0.507 |
| 3.394 | 0.509 |
| 3.395 | 0.512 |
| 3.396 | 0.514 |
| 3.397 | 0.516 |
| 3.398 | 0.518 |
| 3.399 | 0.52 |
| 3.4 | 0.522 |
| 3.401 | 0.525 |
| 3.402 | 0.527 |
| 3.403 | 0.529 |
| 3.404 | 0.531 |
| 3.405 | 0.534 |
| 3.406 | 0.536 |
| 3.407 | 0.538 |
| 3.408 | 0.54 |
| 3.409 | 0.543 |
| 3.41 | 0.545 |
| 3.411 | 0.547 |
| 3.412 | 0.549 |
| 3.413 | 0.551 |
| 3.414 | 0.554 |
| 3.415 | 0.556 |
| 3.416 | 0.558 |
| 3.417 | 0.56 |
| 3.418 | 0.563 |
| 3.419 | 0.565 |
| 3.42 | 0.567 |
| 3.421 | 0.57 |
| 3.422 | 0.572 |
| 3.423 | 0.574 |
| 3.424 | 0.576 |
| 3.425 | 0.579 |
| 3.426 | 0.581 |
| 3.427 | 0.583 |
| 3.428 | 0.585 |
| 3.429 | 0.588 |
| 3.43 | 0.59 |
| 3.431 | 0.592 |
| 3.432 | 0.595 |
| 3.433 | 0.597 |
| 3.434 | 0.599 |
| 3.435 | 0.601 |
| 3.436 | 0.604 |
| 3.437 | 0.606 |
| 3.438 | 0.608 |
| 3.439 | 0.611 |
| 3.44 | 0.613 |
| 3.441 | 0.615 |
| 3.442 | 0.617 |
| 3.443 | 0.62 |
| 3.444 | 0.622 |
| 3.445 | 0.624 |
| 3.446 | 0.627 |
| 3.447 | 0.629 |
| 3.448 | 0.631 |
| 3.449 | 0.634 |
| 3.45 | 0.636 |
| 3.451 | 0.638 |
| 3.452 | 0.64 |
| 3.453 | 0.643 |
| 3.454 | 0.645 |
| 3.455 | 0.647 |
| 3.456 | 0.65 |
| 3.457 | 0.652 |
| 3.458 | 0.654 |
| 3.459 | 0.657 |
| 3.46 | 0.659 |
| 3.461 | 0.661 |
| 3.462 | 0.664 |
| 3.463 | 0.666 |
| 3.464 | 0.668 |
| 3.465 | 0.67 |
| 3.466 | 0.673 |
| 3.467 | 0.675 |
| 3.468 | 0.677 |
| 3.469 | 0.68 |
| 3.47 | 0.682 |
| 3.471 | 0.684 |
| 3.472 | 0.687 |
| 3.473 | 0.689 |
| 3.474 | 0.691 |
| 3.475 | 0.693 |
| 3.476 | 0.696 |
| 3.477 | 0.698 |
| 3.478 | 0.7 |
| 3.479 | 0.703 |
| 3.48 | 0.705 |
| 3.481 | 0.707 |
| 3.482 | 0.71 |
| 3.483 | 0.712 |
| 3.484 | 0.714 |
| 3.485 | 0.716 |
| 3.486 | 0.719 |
| 3.487 | 0.721 |
| 3.488 | 0.723 |
| 3.489 | 0.726 |
| 3.49 | 0.728 |
| 3.491 | 0.73 |
| 3.492 | 0.732 |
| 3.493 | 0.735 |
| 3.494 | 0.737 |
| 3.495 | 0.739 |
| 3.496 | 0.741 |
| 3.497 | 0.744 |
| 3.498 | 0.746 |
| 3.499 | 0.748 |
| 3.5 | 0.751 |
| 3.501 | 0.753 |
| 3.502 | 0.755 |
| 3.503 | 0.757 |
| 3.504 | 0.759 |
| 3.505 | 0.762 |
| 3.506 | 0.764 |
| 3.507 | 0.766 |
| 3.508 | 0.768 |
| 3.509 | 0.77 |
| 3.51 | 0.773 |
| 3.511 | 0.775 |
| 3.512 | 0.777 |
| 3.513 | 0.779 |
| 3.514 | 0.781 |
| 3.515 | 0.784 |
| 3.516 | 0.786 |
| 3.517 | 0.788 |
| 3.518 | 0.79 |
| 3.519 | 0.792 |
| 3.52 | 0.795 |
| 3.521 | 0.797 |
| 3.522 | 0.799 |
| 3.523 | 0.801 |
| 3.524 | 0.803 |
| 3.525 | 0.805 |
| 3.526 | 0.808 |
| 3.527 | 0.81 |
| 3.528 | 0.812 |
| 3.529 | 0.814 |
| 3.53 | 0.816 |
| 3.531 | 0.818 |
| 3.532 | 0.82 |
| 3.533 | 0.823 |
| 3.534 | 0.825 |
| 3.535 | 0.827 |
| 3.536 | 0.829 |
| 3.537 | 0.831 |
| 3.538 | 0.833 |
| 3.539 | 0.835 |
| 3.54 | 0.838 |
| 3.541 | 0.84 |
| 3.542 | 0.842 |
| 3.543 | 0.844 |
| 3.544 | 0.846 |
| 3.545 | 0.848 |
| 3.546 | 0.85 |
| 3.547 | 0.852 |
| 3.548 | 0.854 |
| 3.549 | 0.857 |
| 3.55 | 0.859 |
| 3.551 | 0.861 |
| 3.552 | 0.863 |
| 3.553 | 0.865 |
| 3.554 | 0.867 |
| 3.555 | 0.869 |
| 3.556 | 0.871 |
| 3.557 | 0.873 |
| 3.558 | 0.875 |
| 3.559 | 0.877 |
| 3.56 | 0.879 |
| 3.561 | 0.881 |
| 3.562 | 0.884 |
| 3.563 | 0.886 |
| 3.564 | 0.888 |
| 3.565 | 0.89 |
| 3.566 | 0.892 |
| 3.567 | 0.894 |
| 3.568 | 0.896 |
| 3.569 | 0.898 |
| 3.57 | 0.9 |
| 3.571 | 0.902 |
| 3.572 | 0.904 |
| 3.573 | 0.906 |
| 3.574 | 0.908 |
| 3.575 | 0.91 |
| 3.576 | 0.912 |
| 3.577 | 0.914 |
| 3.578 | 0.916 |
| 3.579 | 0.918 |
| 3.58 | 0.92 |
| 3.581 | 0.922 |
| 3.582 | 0.924 |
| 3.583 | 0.926 |
| 3.584 | 0.928 |
| 3.585 | 0.93 |
| 3.586 | 0.932 |
| 3.587 | 0.934 |
| 3.588 | 0.936 |
| 3.589 | 0.938 |
| 3.59 | 0.94 |
| 3.591 | 0.942 |
| 3.592 | 0.944 |
| 3.593 | 0.946 |
| 3.594 | 0.947 |
| 3.595 | 0.949 |
| 3.596 | 0.951 |
| 3.597 | 0.953 |
| 3.598 | 0.955 |
| 3.599 | 0.957 |
| 3.6 | 0.959 |
| 3.601 | 0.961 |
| 3.602 | 0.963 |
| 3.603 | 0.965 |
| 3.604 | 0.967 |
| 3.605 | 0.968 |
| 3.606 | 0.97 |
| 3.607 | 0.972 |
| 3.608 | 0.974 |
| 3.609 | 0.976 |
| 3.61 | 0.978 |
| 3.611 | 0.98 |
| 3.612 | 0.982 |
| 3.613 | 0.983 |
| 3.614 | 0.985 |
| 3.615 | 0.987 |
| 3.616 | 0.989 |
| 3.617 | 0.991 |
| 3.618 | 0.993 |
| 3.619 | 0.995 |
| 3.62 | 0.996 |
| 3.621 | 0.998 |
| 3.622 | 1 |
| 3.623 | 1.002 |
| 3.624 | 1.004 |
| 3.625 | 1.005 |
| 3.626 | 1.007 |
| 3.627 | 1.009 |
| 3.628 | 1.011 |
| 3.629 | 1.013 |
| 3.63 | 1.014 |
| 3.631 | 1.016 |
| 3.632 | 1.018 |
| 3.633 | 1.02 |
| 3.634 | 1.022 |
| 3.635 | 1.023 |
| 3.636 | 1.025 |
| 3.637 | 1.027 |
| 3.638 | 1.029 |
| 3.639 | 1.03 |
| 3.64 | 1.032 |
| 3.641 | 1.034 |
| 3.642 | 1.035 |
| 3.643 | 1.037 |
| 3.644 | 1.039 |
| 3.645 | 1.041 |
| 3.646 | 1.042 |
| 3.647 | 1.044 |
| 3.648 | 1.046 |
| 3.649 | 1.047 |
| 3.65 | 1.049 |
| 3.651 | 1.051 |
| 3.652 | 1.052 |
| 3.653 | 1.054 |
| 3.654 | 1.056 |
| 3.655 | 1.057 |
| 3.656 | 1.059 |
| 3.657 | 1.061 |
| 3.658 | 1.062 |
| 3.659 | 1.064 |
| 3.66 | 1.066 |
| 3.661 | 1.067 |
| 3.662 | 1.069 |
| 3.663 | 1.071 |
| 3.664 | 1.072 |
| 3.665 | 1.074 |
| 3.666 | 1.075 |
| 3.667 | 1.077 |
| 3.668 | 1.079 |
| 3.669 | 1.08 |
| 3.67 | 1.082 |
| 3.671 | 1.083 |
| 3.672 | 1.085 |
| 3.673 | 1.087 |
| 3.674 | 1.088 |
| 3.675 | 1.09 |
| 3.676 | 1.091 |
| 3.677 | 1.093 |
| 3.678 | 1.094 |
| 3.679 | 1.096 |
| 3.68 | 1.098 |
| 3.681 | 1.099 |
| 3.682 | 1.101 |
| 3.683 | 1.102 |
| 3.684 | 1.104 |
| 3.685 | 1.105 |
| 3.686 | 1.107 |
| 3.687 | 1.108 |
| 3.688 | 1.11 |
| 3.689 | 1.111 |
| 3.69 | 1.113 |
| 3.691 | 1.114 |
| 3.692 | 1.116 |
| 3.693 | 1.117 |
| 3.694 | 1.119 |
| 3.695 | 1.12 |
| 3.696 | 1.121 |
| 3.697 | 1.123 |
| 3.698 | 1.124 |
| 3.699 | 1.126 |
| 3.7 | 1.127 |
| 3.701 | 1.129 |
| 3.702 | 1.13 |
| 3.703 | 1.132 |
| 3.704 | 1.133 |
| 3.705 | 1.134 |
| 3.706 | 1.136 |
| 3.707 | 1.137 |
| 3.708 | 1.139 |
| 3.709 | 1.14 |
| 3.71 | 1.141 |
| 3.711 | 1.143 |
| 3.712 | 1.144 |
| 3.713 | 1.145 |
| 3.714 | 1.147 |
| 3.715 | 1.148 |
| 3.716 | 1.15 |
| 3.717 | 1.151 |
| 3.718 | 1.152 |
| 3.719 | 1.154 |
| 3.72 | 1.155 |
| 3.721 | 1.156 |
| 3.722 | 1.158 |
| 3.723 | 1.159 |
| 3.724 | 1.16 |
| 3.725 | 1.162 |
| 3.726 | 1.163 |
| 3.727 | 1.164 |
| 3.728 | 1.165 |
| 3.729 | 1.167 |
| 3.73 | 1.168 |
| 3.731 | 1.169 |
| 3.732 | 1.17 |
| 3.733 | 1.172 |
| 3.734 | 1.173 |
| 3.735 | 1.174 |
| 3.736 | 1.176 |
| 3.737 | 1.177 |
| 3.738 | 1.178 |
| 3.739 | 1.179 |
| 3.74 | 1.18 |
| 3.741 | 1.182 |
| 3.742 | 1.183 |
| 3.743 | 1.184 |
| 3.744 | 1.185 |
| 3.745 | 1.186 |
| 3.746 | 1.188 |
| 3.747 | 1.189 |
| 3.748 | 1.19 |
| 3.749 | 1.191 |
| 3.75 | 1.192 |
| 3.751 | 1.193 |
| 3.752 | 1.195 |
| 3.753 | 1.196 |
| 3.754 | 1.197 |
| 3.755 | 1.198 |
| 3.756 | 1.199 |
| 3.757 | 1.2 |
| 3.758 | 1.201 |
| 3.759 | 1.203 |
| 3.76 | 1.204 |
| 3.761 | 1.205 |
| 3.762 | 1.206 |
| 3.763 | 1.207 |
| 3.764 | 1.208 |
| 3.765 | 1.209 |
| 3.766 | 1.21 |
| 3.767 | 1.211 |
| 3.768 | 1.212 |
| 3.769 | 1.213 |
| 3.77 | 1.215 |
| 3.771 | 1.216 |
| 3.772 | 1.217 |
| 3.773 | 1.218 |
| 3.774 | 1.219 |
| 3.775 | 1.22 |
| 3.776 | 1.221 |
| 3.777 | 1.222 |
| 3.778 | 1.223 |
| 3.779 | 1.224 |
| 3.78 | 1.225 |
| 3.781 | 1.226 |
| 3.782 | 1.227 |
| 3.783 | 1.228 |
| 3.784 | 1.229 |
| 3.785 | 1.23 |
| 3.786 | 1.231 |
| 3.787 | 1.232 |
| 3.788 | 1.233 |
| 3.789 | 1.234 |
| 3.79 | 1.235 |
| 3.791 | 1.236 |
| 3.792 | 1.236 |
| 3.793 | 1.237 |
| 3.794 | 1.238 |
| 3.795 | 1.239 |
| 3.796 | 1.24 |
| 3.797 | 1.241 |
| 3.798 | 1.242 |
| 3.799 | 1.243 |
| 3.8 | 1.244 |
| 3.801 | 1.245 |
| 3.802 | 1.246 |
| 3.803 | 1.246 |
| 3.804 | 1.247 |
| 3.805 | 1.248 |
| 3.806 | 1.249 |
| 3.807 | 1.25 |
| 3.808 | 1.251 |
| 3.809 | 1.252 |
| 3.81 | 1.253 |
| 3.811 | 1.253 |
| 3.812 | 1.254 |
| 3.813 | 1.255 |
| 3.814 | 1.256 |
| 3.815 | 1.257 |
| 3.816 | 1.258 |
| 3.817 | 1.258 |
| 3.818 | 1.259 |
| 3.819 | 1.26 |
| 3.82 | 1.261 |
| 3.821 | 1.262 |
| 3.822 | 1.263 |
| 3.823 | 1.263 |
| 3.824 | 1.264 |
| 3.825 | 1.265 |
| 3.826 | 1.266 |
| 3.827 | 1.266 |
| 3.828 | 1.267 |
| 3.829 | 1.268 |
| 3.83 | 1.269 |
| 3.831 | 1.269 |
| 3.832 | 1.27 |
| 3.833 | 1.271 |
| 3.834 | 1.272 |
| 3.835 | 1.272 |
| 3.836 | 1.273 |
| 3.837 | 1.274 |
| 3.838 | 1.275 |
| 3.839 | 1.275 |
| 3.84 | 1.276 |
| 3.841 | 1.277 |
| 3.842 | 1.277 |
| 3.843 | 1.278 |
| 3.844 | 1.279 |
| 3.845 | 1.279 |
| 3.846 | 1.28 |
| 3.847 | 1.281 |
| 3.848 | 1.281 |
| 3.849 | 1.282 |
| 3.85 | 1.283 |
| 3.851 | 1.283 |
| 3.852 | 1.284 |
| 3.853 | 1.285 |
| 3.854 | 1.285 |
| 3.855 | 1.286 |
| 3.856 | 1.286 |
| 3.857 | 1.287 |
| 3.858 | 1.288 |
| 3.859 | 1.288 |
| 3.86 | 1.289 |
| 3.861 | 1.289 |
| 3.862 | 1.29 |
| 3.863 | 1.291 |
| 3.864 | 1.291 |
| 3.865 | 1.292 |
| 3.866 | 1.292 |
| 3.867 | 1.293 |
| 3.868 | 1.293 |
| 3.869 | 1.294 |
| 3.87 | 1.295 |
| 3.871 | 1.295 |
| 3.872 | 1.296 |
| 3.873 | 1.296 |
| 3.874 | 1.297 |
| 3.875 | 1.297 |
| 3.876 | 1.298 |
| 3.877 | 1.298 |
| 3.878 | 1.299 |
| 3.879 | 1.299 |
| 3.88 | 1.3 |
| 3.881 | 1.3 |
| 3.882 | 1.301 |
| 3.883 | 1.301 |
| 3.884 | 1.302 |
| 3.885 | 1.302 |
| 3.886 | 1.302 |
| 3.887 | 1.303 |
| 3.888 | 1.303 |
| 3.889 | 1.304 |
| 3.89 | 1.304 |
| 3.891 | 1.305 |
| 3.892 | 1.305 |
| 3.893 | 1.305 |
| 3.894 | 1.306 |
| 3.895 | 1.306 |
| 3.896 | 1.307 |
| 3.897 | 1.307 |
| 3.898 | 1.308 |
| 3.899 | 1.308 |
| 3.9 | 1.308 |
| 3.901 | 1.309 |
| 3.902 | 1.309 |
| 3.903 | 1.309 |
| 3.904 | 1.31 |
| 3.905 | 1.31 |
| 3.906 | 1.31 |
| 3.907 | 1.311 |
| 3.908 | 1.311 |
| 3.909 | 1.312 |
| 3.91 | 1.312 |
| 3.911 | 1.312 |
| 3.912 | 1.313 |
| 3.913 | 1.313 |
| 3.914 | 1.313 |
| 3.915 | 1.313 |
| 3.916 | 1.314 |
| 3.917 | 1.314 |
| 3.918 | 1.314 |
| 3.919 | 1.315 |
| 3.92 | 1.315 |
| 3.921 | 1.315 |
| 3.922 | 1.316 |
| 3.923 | 1.316 |
| 3.924 | 1.316 |
| 3.925 | 1.316 |
| 3.926 | 1.317 |
| 3.927 | 1.317 |
| 3.928 | 1.317 |
| 3.929 | 1.317 |
| 3.93 | 1.318 |
| 3.931 | 1.318 |
| 3.932 | 1.318 |
| 3.933 | 1.318 |
| 3.934 | 1.319 |
| 3.935 | 1.319 |
| 3.936 | 1.319 |
| 3.937 | 1.319 |
| 3.938 | 1.319 |
| 3.939 | 1.32 |
| 3.94 | 1.32 |
| 3.941 | 1.32 |
| 3.942 | 1.32 |
| 3.943 | 1.32 |
| 3.944 | 1.32 |
| 3.945 | 1.321 |
| 3.946 | 1.321 |
| 3.947 | 1.321 |
| 3.948 | 1.321 |
| 3.949 | 1.321 |
| 3.95 | 1.321 |
| 3.951 | 1.322 |
| 3.952 | 1.322 |
| 3.953 | 1.322 |
| 3.954 | 1.322 |
| 3.955 | 1.322 |
| 3.956 | 1.322 |
| 3.957 | 1.322 |
| 3.958 | 1.322 |
| 3.959 | 1.323 |
| 3.96 | 1.323 |
| 3.961 | 1.323 |
| 3.962 | 1.323 |
| 3.963 | 1.323 |
| 3.964 | 1.323 |
| 3.965 | 1.323 |
| 3.966 | 1.323 |
| 3.967 | 1.323 |
| 3.968 | 1.323 |
| 3.969 | 1.323 |
| 3.97 | 1.323 |
| 3.971 | 1.323 |
| 3.972 | 1.323 |
| 3.973 | 1.324 |
| 3.974 | 1.324 |
| 3.975 | 1.324 |
| 3.976 | 1.324 |
| 3.977 | 1.324 |
| 3.978 | 1.324 |
| 3.979 | 1.324 |
| 3.98 | 1.324 |
| 3.981 | 1.324 |
| 3.982 | 1.324 |
| 3.983 | 1.324 |
| 3.984 | 1.324 |
| 3.985 | 1.324 |
| 3.986 | 1.324 |
| 3.987 | 1.324 |
| 3.988 | 1.324 |
| 3.989 | 1.324 |
| 3.99 | 1.324 |
| 3.991 | 1.324 |
| 3.992 | 1.323 |
| 3.993 | 1.323 |
| 3.994 | 1.323 |
| 3.995 | 1.323 |
| 3.996 | 1.323 |
| 3.997 | 1.323 |
| 3.998 | 1.323 |
| 3.999 | 1.323 |
| 4.0 | 1.322 |
| 4.001 | 1.322 |
| 4.002 | 1.322 |
| 4.003 | 1.322 |
| 4.004 | 1.322 |
| 4.005 | 1.322 |
| 4.006 | 1.322 |
| 4.007 | 1.322 |
| 4.008 | 1.322 |
| 4.009 | 1.321 |
| 4.01 | 1.321 |
| 4.011 | 1.321 |
| 4.012 | 1.321 |
| 4.013 | 1.321 |
| 4.014 | 1.321 |
| 4.015 | 1.321 |
| 4.016 | 1.321 |
| 4.017 | 1.32 |
| 4.018 | 1.32 |
| 4.019 | 1.32 |
| 4.02 | 1.32 |
| 4.021 | 1.32 |
| 4.022 | 1.32 |
| 4.023 | 1.319 |
| 4.024 | 1.319 |
| 4.025 | 1.319 |
| 4.026 | 1.319 |
| 4.027 | 1.319 |
| 4.028 | 1.318 |
| 4.029 | 1.318 |
| 4.03 | 1.318 |
| 4.031 | 1.318 |
| 4.032 | 1.318 |
| 4.033 | 1.317 |
| 4.034 | 1.317 |
| 4.035 | 1.317 |
| 4.036 | 1.317 |
| 4.037 | 1.317 |
| 4.038 | 1.316 |
| 4.039 | 1.316 |
| 4.04 | 1.316 |
| 4.041 | 1.316 |
| 4.042 | 1.315 |
| 4.043 | 1.315 |
| 4.044 | 1.315 |
| 4.045 | 1.315 |
| 4.046 | 1.314 |
| 4.047 | 1.314 |
| 4.048 | 1.314 |
| 4.049 | 1.313 |
| 4.05 | 1.313 |
| 4.051 | 1.313 |
| 4.052 | 1.313 |
| 4.053 | 1.312 |
| 4.054 | 1.312 |
| 4.055 | 1.312 |
| 4.056 | 1.311 |
| 4.057 | 1.311 |
| 4.058 | 1.311 |
| 4.059 | 1.31 |
| 4.06 | 1.31 |
| 4.061 | 1.31 |
| 4.062 | 1.309 |
| 4.063 | 1.309 |
| 4.064 | 1.309 |
| 4.065 | 1.308 |
| 4.066 | 1.308 |
| 4.067 | 1.308 |
| 4.068 | 1.307 |
| 4.069 | 1.307 |
| 4.07 | 1.307 |
| 4.071 | 1.306 |
| 4.072 | 1.306 |
| 4.073 | 1.306 |
| 4.074 | 1.305 |
| 4.075 | 1.305 |
| 4.076 | 1.305 |
| 4.077 | 1.304 |
| 4.078 | 1.304 |
| 4.079 | 1.303 |
| 4.08 | 1.303 |
| 4.081 | 1.303 |
| 4.082 | 1.302 |
| 4.083 | 1.302 |
| 4.084 | 1.301 |
| 4.085 | 1.301 |
| 4.086 | 1.301 |
| 4.087 | 1.3 |
| 4.088 | 1.3 |
| 4.089 | 1.299 |
| 4.09 | 1.299 |
| 4.091 | 1.298 |
| 4.092 | 1.298 |
| 4.093 | 1.298 |
| 4.094 | 1.297 |
| 4.095 | 1.297 |
| 4.096 | 1.296 |
| 4.097 | 1.296 |
| 4.098 | 1.295 |
| 4.099 | 1.295 |
| 4.1 | 1.294 |
| 4.101 | 1.294 |
| 4.102 | 1.293 |
| 4.103 | 1.293 |
| 4.104 | 1.292 |
| 4.105 | 1.292 |
| 4.106 | 1.292 |
| 4.107 | 1.291 |
| 4.108 | 1.291 |
| 4.109 | 1.29 |
| 4.11 | 1.29 |
| 4.111 | 1.289 |
| 4.112 | 1.289 |
| 4.113 | 1.288 |
| 4.114 | 1.288 |
| 4.115 | 1.287 |
| 4.116 | 1.287 |
| 4.117 | 1.286 |
| 4.118 | 1.285 |
| 4.119 | 1.285 |
| 4.12 | 1.284 |
| 4.121 | 1.284 |
| 4.122 | 1.283 |
| 4.123 | 1.283 |
| 4.124 | 1.282 |
| 4.125 | 1.282 |
| 4.126 | 1.281 |
| 4.127 | 1.281 |
| 4.128 | 1.28 |
| 4.129 | 1.28 |
| 4.13 | 1.279 |
| 4.131 | 1.278 |
| 4.132 | 1.278 |
| 4.133 | 1.277 |
| 4.134 | 1.277 |
| 4.135 | 1.276 |
| 4.136 | 1.276 |
| 4.137 | 1.275 |
| 4.138 | 1.274 |
| 4.139 | 1.274 |
| 4.14 | 1.273 |
| 4.141 | 1.273 |
| 4.142 | 1.272 |
| 4.143 | 1.271 |
| 4.144 | 1.271 |
| 4.145 | 1.27 |
| 4.146 | 1.27 |
| 4.147 | 1.269 |
| 4.148 | 1.268 |
| 4.149 | 1.268 |
| 4.15 | 1.267 |
| 4.151 | 1.266 |
| 4.152 | 1.266 |
| 4.153 | 1.265 |
| 4.154 | 1.264 |
| 4.155 | 1.264 |
| 4.156 | 1.263 |
| 4.157 | 1.262 |
| 4.158 | 1.262 |
| 4.159 | 1.261 |
| 4.16 | 1.26 |
| 4.161 | 1.26 |
| 4.162 | 1.259 |
| 4.163 | 1.258 |
| 4.164 | 1.258 |
| 4.165 | 1.257 |
| 4.166 | 1.256 |
| 4.167 | 1.256 |
| 4.168 | 1.255 |
| 4.169 | 1.254 |
| 4.17 | 1.254 |
| 4.171 | 1.253 |
| 4.172 | 1.252 |
| 4.173 | 1.252 |
| 4.174 | 1.251 |
| 4.175 | 1.25 |
| 4.176 | 1.25 |
| 4.177 | 1.249 |
| 4.178 | 1.248 |
| 4.179 | 1.247 |
| 4.18 | 1.247 |
| 4.181 | 1.246 |
| 4.182 | 1.245 |
| 4.183 | 1.244 |
| 4.184 | 1.244 |
| 4.185 | 1.243 |
| 4.186 | 1.242 |
| 4.187 | 1.242 |
| 4.188 | 1.241 |
| 4.189 | 1.24 |
| 4.19 | 1.239 |
| 4.191 | 1.239 |
| 4.192 | 1.238 |
| 4.193 | 1.237 |
| 4.194 | 1.236 |
| 4.195 | 1.236 |
| 4.196 | 1.235 |
| 4.197 | 1.234 |
| 4.198 | 1.233 |
| 4.199 | 1.233 |
| 4.2 | 1.232 |
| 4.201 | 1.231 |
| 4.202 | 1.23 |
| 4.203 | 1.229 |
| 4.204 | 1.229 |
| 4.205 | 1.228 |
| 4.206 | 1.227 |
| 4.207 | 1.226 |
| 4.208 | 1.226 |
| 4.209 | 1.225 |
| 4.21 | 1.224 |
| 4.211 | 1.223 |
| 4.212 | 1.222 |
| 4.213 | 1.222 |
| 4.214 | 1.221 |
| 4.215 | 1.22 |
| 4.216 | 1.219 |
| 4.217 | 1.219 |
| 4.218 | 1.218 |
| 4.219 | 1.217 |
| 4.22 | 1.216 |
| 4.221 | 1.215 |
| 4.222 | 1.214 |
| 4.223 | 1.214 |
| 4.224 | 1.213 |
| 4.225 | 1.212 |
| 4.226 | 1.211 |
| 4.227 | 1.21 |
| 4.228 | 1.21 |
| 4.229 | 1.209 |
| 4.23 | 1.208 |
| 4.231 | 1.207 |
| 4.232 | 1.206 |
| 4.233 | 1.205 |
| 4.234 | 1.205 |
| 4.235 | 1.204 |
| 4.236 | 1.203 |
| 4.237 | 1.202 |
| 4.238 | 1.201 |
| 4.239 | 1.2 |
| 4.24 | 1.2 |
| 4.241 | 1.199 |
| 4.242 | 1.198 |
| 4.243 | 1.197 |
| 4.244 | 1.196 |
| 4.245 | 1.195 |
| 4.246 | 1.194 |
| 4.247 | 1.193 |
| 4.248 | 1.193 |
| 4.249 | 1.192 |
| 4.25 | 1.191 |
| 4.251 | 1.19 |
| 4.252 | 1.189 |
| 4.253 | 1.188 |
| 4.254 | 1.187 |
| 4.255 | 1.186 |
| 4.256 | 1.186 |
| 4.257 | 1.185 |
| 4.258 | 1.184 |
| 4.259 | 1.183 |
| 4.26 | 1.182 |
| 4.261 | 1.181 |
| 4.262 | 1.18 |
| 4.263 | 1.179 |
| 4.264 | 1.178 |
| 4.265 | 1.178 |
| 4.266 | 1.177 |
| 4.267 | 1.176 |
| 4.268 | 1.175 |
| 4.269 | 1.174 |
| 4.27 | 1.173 |
| 4.271 | 1.172 |
| 4.272 | 1.171 |
| 4.273 | 1.17 |
| 4.274 | 1.169 |
| 4.275 | 1.168 |
| 4.276 | 1.167 |
| 4.277 | 1.167 |
| 4.278 | 1.166 |
| 4.279 | 1.165 |
| 4.28 | 1.164 |
| 4.281 | 1.163 |
| 4.282 | 1.162 |
| 4.283 | 1.161 |
| 4.284 | 1.16 |
| 4.285 | 1.159 |
| 4.286 | 1.158 |
| 4.287 | 1.157 |
| 4.288 | 1.156 |
| 4.289 | 1.155 |
| 4.29 | 1.154 |
| 4.291 | 1.153 |
| 4.292 | 1.152 |
| 4.293 | 1.151 |
| 4.294 | 1.15 |
| 4.295 | 1.149 |
| 4.296 | 1.149 |
| 4.297 | 1.148 |
| 4.298 | 1.147 |
| 4.299 | 1.146 |
| 4.3 | 1.145 |
| 4.301 | 1.144 |
| 4.302 | 1.143 |
| 4.303 | 1.142 |
| 4.304 | 1.141 |
| 4.305 | 1.14 |
| 4.306 | 1.139 |
| 4.307 | 1.138 |
| 4.308 | 1.137 |
| 4.309 | 1.136 |
| 4.31 | 1.135 |
| 4.311 | 1.134 |
| 4.312 | 1.133 |
| 4.313 | 1.132 |
| 4.314 | 1.131 |
| 4.315 | 1.13 |
| 4.316 | 1.129 |
| 4.317 | 1.128 |
| 4.318 | 1.127 |
| 4.319 | 1.126 |
| 4.32 | 1.125 |
| 4.321 | 1.124 |
| 4.322 | 1.123 |
| 4.323 | 1.122 |
| 4.324 | 1.121 |
| 4.325 | 1.12 |
| 4.326 | 1.119 |
| 4.327 | 1.118 |
| 4.328 | 1.117 |
| 4.329 | 1.116 |
| 4.33 | 1.115 |
| 4.331 | 1.114 |
| 4.332 | 1.113 |
| 4.333 | 1.112 |
| 4.334 | 1.111 |
| 4.335 | 1.11 |
| 4.336 | 1.109 |
| 4.337 | 1.108 |
| 4.338 | 1.106 |
| 4.339 | 1.105 |
| 4.34 | 1.104 |
| 4.341 | 1.103 |
| 4.342 | 1.102 |
| 4.343 | 1.101 |
| 4.344 | 1.1 |
| 4.345 | 1.099 |
| 4.346 | 1.098 |
| 4.347 | 1.097 |
| 4.348 | 1.096 |
| 4.349 | 1.095 |
| 4.35 | 1.094 |
| 4.351 | 1.093 |
| 4.352 | 1.092 |
| 4.353 | 1.091 |
| 4.354 | 1.09 |
| 4.355 | 1.089 |
| 4.356 | 1.088 |
| 4.357 | 1.087 |
| 4.358 | 1.086 |
| 4.359 | 1.085 |
| 4.36 | 1.083 |
| 4.361 | 1.082 |
| 4.362 | 1.081 |
| 4.363 | 1.08 |
| 4.364 | 1.079 |
| 4.365 | 1.078 |
| 4.366 | 1.077 |
| 4.367 | 1.076 |
| 4.368 | 1.075 |
| 4.369 | 1.074 |
| 4.37 | 1.073 |
| 4.371 | 1.072 |
| 4.372 | 1.071 |
| 4.373 | 1.07 |
| 4.374 | 1.068 |
| 4.375 | 1.067 |
| 4.376 | 1.066 |
| 4.377 | 1.065 |
| 4.378 | 1.064 |
| 4.379 | 1.063 |
| 4.38 | 1.062 |
| 4.381 | 1.061 |
| 4.382 | 1.06 |
| 4.383 | 1.059 |
| 4.384 | 1.058 |
| 4.385 | 1.057 |
| 4.386 | 1.055 |
| 4.387 | 1.054 |
| 4.388 | 1.053 |
| 4.389 | 1.052 |
| 4.39 | 1.051 |
| 4.391 | 1.05 |
| 4.392 | 1.049 |
| 4.393 | 1.048 |
| 4.394 | 1.047 |
| 4.395 | 1.046 |
| 4.396 | 1.045 |
| 4.397 | 1.043 |
| 4.398 | 1.042 |
| 4.399 | 1.041 |
| 4.4 | 1.04 |
| 4.401 | 1.039 |
| 4.402 | 1.038 |
| 4.403 | 1.037 |
| 4.404 | 1.036 |
| 4.405 | 1.035 |
| 4.406 | 1.033 |
| 4.407 | 1.032 |
| 4.408 | 1.031 |
| 4.409 | 1.03 |
| 4.41 | 1.029 |
| 4.411 | 1.028 |
| 4.412 | 1.027 |
| 4.413 | 1.026 |
| 4.414 | 1.025 |
| 4.415 | 1.023 |
| 4.416 | 1.022 |
| 4.417 | 1.021 |
| 4.418 | 1.02 |
| 4.419 | 1.019 |
| 4.42 | 1.018 |
| 4.421 | 1.017 |
| 4.422 | 1.016 |
| 4.423 | 1.014 |
| 4.424 | 1.013 |
| 4.425 | 1.012 |
| 4.426 | 1.011 |
| 4.427 | 1.01 |
| 4.428 | 1.009 |
| 4.429 | 1.008 |
| 4.43 | 1.007 |
| 4.431 | 1.006 |
| 4.432 | 1.004 |
| 4.433 | 1.003 |
| 4.434 | 1.002 |
| 4.435 | 1.001 |
| 4.436 | 1 |
| 4.437 | 0.999 |
| 4.438 | 0.998 |
| 4.439 | 0.996 |
| 4.44 | 0.995 |
| 4.441 | 0.994 |
| 4.442 | 0.993 |
| 4.443 | 0.992 |
| 4.444 | 0.991 |
| 4.445 | 0.99 |
| 4.446 | 0.988 |
| 4.447 | 0.987 |
| 4.448 | 0.986 |
| 4.449 | 0.985 |
| 4.45 | 0.984 |
| 4.451 | 0.983 |
| 4.452 | 0.982 |
| 4.453 | 0.98 |
| 4.454 | 0.979 |
| 4.455 | 0.978 |
| 4.456 | 0.977 |
| 4.457 | 0.976 |
| 4.458 | 0.975 |
| 4.459 | 0.974 |
| 4.46 | 0.972 |
| 4.461 | 0.971 |
| 4.462 | 0.97 |
| 4.463 | 0.969 |
| 4.464 | 0.968 |
| 4.465 | 0.967 |
| 4.466 | 0.966 |
| 4.467 | 0.964 |
| 4.468 | 0.963 |
| 4.469 | 0.962 |
| 4.47 | 0.961 |
| 4.471 | 0.96 |
| 4.472 | 0.959 |
| 4.473 | 0.958 |
| 4.474 | 0.956 |
| 4.475 | 0.955 |
| 4.476 | 0.954 |
| 4.477 | 0.953 |
| 4.478 | 0.952 |
| 4.479 | 0.951 |
| 4.48 | 0.949 |
| 4.481 | 0.948 |
| 4.482 | 0.947 |
| 4.483 | 0.946 |
| 4.484 | 0.945 |
| 4.485 | 0.944 |
| 4.486 | 0.943 |
| 4.487 | 0.941 |
| 4.488 | 0.94 |
| 4.489 | 0.939 |
| 4.49 | 0.938 |
| 4.491 | 0.937 |
| 4.492 | 0.936 |
| 4.493 | 0.934 |
| 4.494 | 0.933 |
| 4.495 | 0.932 |
| 4.496 | 0.931 |
| 4.497 | 0.93 |
| 4.498 | 0.929 |
| 4.499 | 0.927 |
| 4.5 | 0.926 |
| 4.501 | 0.925 |
| 4.502 | 0.924 |
| 4.503 | 0.923 |
| 4.504 | 0.921 |
| 4.505 | 0.92 |
| 4.506 | 0.919 |
| 4.507 | 0.918 |
| 4.508 | 0.916 |
| 4.509 | 0.915 |
| 4.51 | 0.914 |
| 4.511 | 0.913 |
| 4.512 | 0.911 |
| 4.513 | 0.91 |
| 4.514 | 0.909 |
| 4.515 | 0.908 |
| 4.516 | 0.906 |
| 4.517 | 0.905 |
| 4.518 | 0.904 |
| 4.519 | 0.903 |
| 4.52 | 0.901 |
| 4.521 | 0.9 |
| 4.522 | 0.899 |
| 4.523 | 0.898 |
| 4.524 | 0.896 |
| 4.525 | 0.895 |
| 4.526 | 0.894 |
| 4.527 | 0.893 |
| 4.528 | 0.891 |
| 4.529 | 0.89 |
| 4.53 | 0.889 |
| 4.531 | 0.888 |
| 4.532 | 0.886 |
| 4.533 | 0.885 |
| 4.534 | 0.884 |
| 4.535 | 0.883 |
| 4.536 | 0.881 |
| 4.537 | 0.88 |
| 4.538 | 0.879 |
| 4.539 | 0.878 |
| 4.54 | 0.876 |
| 4.541 | 0.875 |
| 4.542 | 0.874 |
| 4.543 | 0.873 |
| 4.544 | 0.871 |
| 4.545 | 0.87 |
| 4.546 | 0.869 |
| 4.547 | 0.868 |
| 4.548 | 0.866 |
| 4.549 | 0.865 |
| 4.55 | 0.864 |
| 4.551 | 0.863 |
| 4.552 | 0.862 |
| 4.553 | 0.86 |
| 4.554 | 0.859 |
| 4.555 | 0.858 |
| 4.556 | 0.857 |
| 4.557 | 0.855 |
| 4.558 | 0.854 |
| 4.559 | 0.853 |
| 4.56 | 0.852 |
| 4.561 | 0.85 |
| 4.562 | 0.849 |
| 4.563 | 0.848 |
| 4.564 | 0.847 |
| 4.565 | 0.845 |
| 4.566 | 0.844 |
| 4.567 | 0.843 |
| 4.568 | 0.842 |
| 4.569 | 0.84 |
| 4.57 | 0.839 |
| 4.571 | 0.838 |
| 4.572 | 0.837 |
| 4.573 | 0.835 |
| 4.574 | 0.834 |
| 4.575 | 0.833 |
| 4.576 | 0.832 |
| 4.577 | 0.83 |
| 4.578 | 0.829 |
| 4.579 | 0.828 |
| 4.58 | 0.827 |
| 4.581 | 0.826 |
| 4.582 | 0.824 |
| 4.583 | 0.823 |
| 4.584 | 0.822 |
| 4.585 | 0.821 |
| 4.586 | 0.819 |
| 4.587 | 0.818 |
| 4.588 | 0.817 |
| 4.589 | 0.816 |
| 4.59 | 0.814 |
| 4.591 | 0.813 |
| 4.592 | 0.812 |
| 4.593 | 0.811 |
| 4.594 | 0.809 |
| 4.595 | 0.808 |
| 4.596 | 0.807 |
| 4.597 | 0.805 |
| 4.598 | 0.804 |
| 4.599 | 0.803 |
| 4.6 | 0.801 |
| 4.601 | 0.8 |
| 4.602 | 0.799 |
| 4.603 | 0.798 |
| 4.604 | 0.796 |
| 4.605 | 0.795 |
| 4.606 | 0.794 |
| 4.607 | 0.793 |
| 4.608 | 0.791 |
| 4.609 | 0.79 |
| 4.61 | 0.789 |
| 4.611 | 0.788 |
| 4.612 | 0.787 |
| 4.613 | 0.785 |
| 4.614 | 0.784 |
| 4.615 | 0.783 |
| 4.616 | 0.782 |
| 4.617 | 0.78 |
| 4.618 | 0.779 |
| 4.619 | 0.778 |
| 4.62 | 0.777 |
| 4.621 | 0.776 |
| 4.622 | 0.774 |
| 4.623 | 0.773 |
| 4.624 | 0.772 |
| 4.625 | 0.771 |
| 4.626 | 0.77 |
| 4.627 | 0.768 |
| 4.628 | 0.767 |
| 4.629 | 0.766 |
| 4.63 | 0.765 |
| 4.631 | 0.764 |
| 4.632 | 0.762 |
| 4.633 | 0.761 |
| 4.634 | 0.76 |
| 4.635 | 0.759 |
| 4.636 | 0.757 |
| 4.637 | 0.756 |
| 4.638 | 0.755 |
| 4.639 | 0.754 |
| 4.64 | 0.753 |
| 4.641 | 0.751 |
| 4.642 | 0.75 |
| 4.643 | 0.749 |
| 4.644 | 0.748 |
| 4.645 | 0.747 |
| 4.646 | 0.745 |
| 4.647 | 0.744 |
| 4.648 | 0.743 |
| 4.649 | 0.742 |
| 4.65 | 0.741 |
| 4.651 | 0.739 |
| 4.652 | 0.738 |
| 4.653 | 0.737 |
| 4.654 | 0.736 |
| 4.655 | 0.735 |
| 4.656 | 0.733 |
| 4.657 | 0.732 |
| 4.658 | 0.731 |
| 4.659 | 0.73 |
| 4.66 | 0.729 |
| 4.661 | 0.728 |
| 4.662 | 0.726 |
| 4.663 | 0.725 |
| 4.664 | 0.724 |
| 4.665 | 0.723 |
| 4.666 | 0.722 |
| 4.667 | 0.72 |
| 4.668 | 0.719 |
| 4.669 | 0.718 |
| 4.67 | 0.717 |
| 4.671 | 0.716 |
| 4.672 | 0.714 |
| 4.673 | 0.713 |
| 4.674 | 0.712 |
| 4.675 | 0.711 |
| 4.676 | 0.71 |
| 4.677 | 0.709 |
| 4.678 | 0.707 |
| 4.679 | 0.706 |
| 4.68 | 0.705 |
| 4.681 | 0.704 |
| 4.682 | 0.703 |
| 4.683 | 0.702 |
| 4.684 | 0.7 |
| 4.685 | 0.699 |
| 4.686 | 0.698 |
| 4.687 | 0.697 |
| 4.688 | 0.696 |
| 4.689 | 0.694 |
| 4.69 | 0.693 |
| 4.691 | 0.692 |
| 4.692 | 0.691 |
| 4.693 | 0.69 |
| 4.694 | 0.689 |
| 4.695 | 0.687 |
| 4.696 | 0.686 |
| 4.697 | 0.685 |
| 4.698 | 0.684 |
| 4.699 | 0.683 |
| 4.7 | 0.682 |
| 4.701 | 0.681 |
| 4.702 | 0.679 |
| 4.703 | 0.678 |
| 4.704 | 0.677 |
| 4.705 | 0.676 |
| 4.706 | 0.675 |
| 4.707 | 0.674 |
| 4.708 | 0.672 |
| 4.709 | 0.671 |
| 4.71 | 0.67 |
| 4.711 | 0.669 |
| 4.712 | 0.668 |
| 4.713 | 0.667 |
| 4.714 | 0.666 |
| 4.715 | 0.664 |
| 4.716 | 0.663 |
| 4.717 | 0.662 |
| 4.718 | 0.661 |
| 4.719 | 0.66 |
| 4.72 | 0.659 |
| 4.721 | 0.658 |
| 4.722 | 0.656 |
| 4.723 | 0.655 |
| 4.724 | 0.654 |
| 4.725 | 0.653 |
| 4.726 | 0.652 |
| 4.727 | 0.651 |
| 4.728 | 0.65 |
| 4.729 | 0.648 |
| 4.73 | 0.647 |
| 4.731 | 0.646 |
| 4.732 | 0.645 |
| 4.733 | 0.644 |
| 4.734 | 0.643 |
| 4.735 | 0.642 |
| 4.736 | 0.641 |
| 4.737 | 0.639 |
| 4.738 | 0.638 |
| 4.739 | 0.637 |
| 4.74 | 0.636 |
| 4.741 | 0.635 |
| 4.742 | 0.634 |
| 4.743 | 0.633 |
| 4.744 | 0.632 |
| 4.745 | 0.631 |
| 4.746 | 0.629 |
| 4.747 | 0.628 |
| 4.748 | 0.627 |
| 4.749 | 0.626 |
| 4.75 | 0.625 |
| 4.751 | 0.624 |
| 4.752 | 0.623 |
| 4.753 | 0.622 |
| 4.754 | 0.621 |
| 4.755 | 0.619 |
| 4.756 | 0.618 |
| 4.757 | 0.617 |
| 4.758 | 0.616 |
| 4.759 | 0.615 |
| 4.76 | 0.614 |
| 4.761 | 0.613 |
| 4.762 | 0.612 |
| 4.763 | 0.611 |
| 4.764 | 0.61 |
| 4.765 | 0.608 |
| 4.766 | 0.607 |
| 4.767 | 0.606 |
| 4.768 | 0.605 |
| 4.769 | 0.604 |
| 4.77 | 0.603 |
| 4.771 | 0.602 |
| 4.772 | 0.601 |
| 4.773 | 0.6 |
| 4.774 | 0.599 |
| 4.775 | 0.598 |
| 4.776 | 0.596 |
| 4.777 | 0.595 |
| 4.778 | 0.594 |
| 4.779 | 0.593 |
| 4.78 | 0.592 |
| 4.781 | 0.591 |
| 4.782 | 0.59 |
| 4.783 | 0.589 |
| 4.784 | 0.588 |
| 4.785 | 0.587 |
| 4.786 | 0.586 |
| 4.787 | 0.585 |
| 4.788 | 0.584 |
| 4.789 | 0.583 |
| 4.79 | 0.581 |
| 4.791 | 0.58 |
| 4.792 | 0.579 |
| 4.793 | 0.578 |
| 4.794 | 0.577 |
| 4.795 | 0.576 |
| 4.796 | 0.575 |
| 4.797 | 0.574 |
| 4.798 | 0.573 |
| 4.799 | 0.572 |
| 4.8 | 0.571 |
| 4.801 | 0.57 |
| 4.802 | 0.569 |
| 4.803 | 0.568 |
| 4.804 | 0.567 |
| 4.805 | 0.566 |
| 4.806 | 0.565 |
| 4.807 | 0.564 |
| 4.808 | 0.563 |
| 4.809 | 0.562 |
| 4.81 | 0.56 |
| 4.811 | 0.559 |
| 4.812 | 0.558 |
| 4.813 | 0.557 |
| 4.814 | 0.556 |
| 4.815 | 0.555 |
| 4.816 | 0.554 |
| 4.817 | 0.553 |
| 4.818 | 0.552 |
| 4.819 | 0.551 |
| 4.82 | 0.55 |
| 4.821 | 0.549 |
| 4.822 | 0.548 |
| 4.823 | 0.547 |
| 4.824 | 0.546 |
| 4.825 | 0.545 |
| 4.826 | 0.544 |
| 4.827 | 0.543 |
| 4.828 | 0.542 |
| 4.829 | 0.541 |
| 4.83 | 0.54 |
| 4.831 | 0.539 |
| 4.832 | 0.538 |
| 4.833 | 0.537 |
| 4.834 | 0.536 |
| 4.835 | 0.535 |
| 4.836 | 0.534 |
| 4.837 | 0.533 |
| 4.838 | 0.532 |
| 4.839 | 0.531 |
| 4.84 | 0.53 |
| 4.841 | 0.529 |
| 4.842 | 0.528 |
| 4.843 | 0.527 |
| 4.844 | 0.526 |
| 4.845 | 0.525 |
| 4.846 | 0.524 |
| 4.847 | 0.523 |
| 4.848 | 0.522 |
| 4.849 | 0.521 |
| 4.85 | 0.52 |
| 4.851 | 0.519 |
| 4.852 | 0.518 |
| 4.853 | 0.517 |
| 4.854 | 0.516 |
| 4.855 | 0.515 |
| 4.856 | 0.514 |
| 4.857 | 0.513 |
| 4.858 | 0.512 |
| 4.859 | 0.511 |
| 4.86 | 0.51 |
| 4.861 | 0.509 |
| 4.862 | 0.508 |
| 4.863 | 0.508 |
| 4.864 | 0.507 |
| 4.865 | 0.506 |
| 4.866 | 0.505 |
| 4.867 | 0.504 |
| 4.868 | 0.503 |
| 4.869 | 0.502 |
| 4.87 | 0.501 |
| 4.871 | 0.5 |
| 4.872 | 0.499 |
| 4.873 | 0.498 |
| 4.874 | 0.497 |
| 4.875 | 0.496 |
| 4.876 | 0.495 |
| 4.877 | 0.494 |
| 4.878 | 0.493 |
| 4.879 | 0.492 |
| 4.88 | 0.491 |
| 4.881 | 0.49 |
| 4.882 | 0.49 |
| 4.883 | 0.489 |
| 4.884 | 0.488 |
| 4.885 | 0.487 |
| 4.886 | 0.486 |
| 4.887 | 0.485 |
| 4.888 | 0.484 |
| 4.889 | 0.483 |
| 4.89 | 0.482 |
| 4.891 | 0.481 |
| 4.892 | 0.48 |
| 4.893 | 0.479 |
| 4.894 | 0.479 |
| 4.895 | 0.478 |
| 4.896 | 0.477 |
| 4.897 | 0.476 |
| 4.898 | 0.475 |
| 4.899 | 0.474 |
| 4.9 | 0.473 |
| 4.901 | 0.472 |
| 4.902 | 0.471 |
| 4.903 | 0.47 |
| 4.904 | 0.469 |
| 4.905 | 0.469 |
| 4.906 | 0.468 |
| 4.907 | 0.467 |
| 4.908 | 0.466 |
| 4.909 | 0.465 |
| 4.91 | 0.464 |
| 4.911 | 0.463 |
| 4.912 | 0.462 |
| 4.913 | 0.462 |
| 4.914 | 0.461 |
| 4.915 | 0.46 |
| 4.916 | 0.459 |
| 4.917 | 0.458 |
| 4.918 | 0.457 |
| 4.919 | 0.456 |
| 4.92 | 0.455 |
| 4.921 | 0.455 |
| 4.922 | 0.454 |
| 4.923 | 0.453 |
| 4.924 | 0.452 |
| 4.925 | 0.451 |
| 4.926 | 0.45 |
| 4.927 | 0.449 |
| 4.928 | 0.448 |
| 4.929 | 0.448 |
| 4.93 | 0.447 |
| 4.931 | 0.446 |
| 4.932 | 0.445 |
| 4.933 | 0.444 |
| 4.934 | 0.443 |
| 4.935 | 0.443 |
| 4.936 | 0.442 |
| 4.937 | 0.441 |
| 4.938 | 0.44 |
| 4.939 | 0.439 |
| 4.94 | 0.438 |
| 4.941 | 0.437 |
| 4.942 | 0.437 |
| 4.943 | 0.436 |
| 4.944 | 0.435 |
| 4.945 | 0.434 |
| 4.946 | 0.433 |
| 4.947 | 0.432 |
| 4.948 | 0.432 |
| 4.949 | 0.431 |
| 4.95 | 0.43 |
| 4.951 | 0.429 |
| 4.952 | 0.428 |
| 4.953 | 0.428 |
| 4.954 | 0.427 |
| 4.955 | 0.426 |
| 4.956 | 0.425 |
| 4.957 | 0.424 |
| 4.958 | 0.424 |
| 4.959 | 0.423 |
| 4.96 | 0.422 |
| 4.961 | 0.421 |
| 4.962 | 0.42 |
| 4.963 | 0.42 |
| 4.964 | 0.419 |
| 4.965 | 0.418 |
| 4.966 | 0.417 |
| 4.967 | 0.416 |
| 4.968 | 0.416 |
| 4.969 | 0.415 |
| 4.97 | 0.414 |
| 4.971 | 0.413 |
| 4.972 | 0.412 |
| 4.973 | 0.412 |
| 4.974 | 0.411 |
| 4.975 | 0.41 |
| 4.976 | 0.409 |
| 4.977 | 0.409 |
| 4.978 | 0.408 |
| 4.979 | 0.407 |
| 4.98 | 0.406 |
| 4.981 | 0.406 |
| 4.982 | 0.405 |
| 4.983 | 0.404 |
| 4.984 | 0.403 |
| 4.985 | 0.402 |
| 4.986 | 0.402 |
| 4.987 | 0.401 |
| 4.988 | 0.4 |
| 4.989 | 0.399 |
| 4.99 | 0.399 |
| 4.991 | 0.398 |
| 4.992 | 0.397 |
| 4.993 | 0.397 |
| 4.994 | 0.396 |
| 4.995 | 0.395 |
| 4.996 | 0.394 |
| 4.997 | 0.394 |
| 4.998 | 0.393 |
| 4.999 | 0.392 |
| 5.0 | 0.391 |
| 5.001 | 0.391 |
| 5.002 | 0.39 |
| 5.003 | 0.389 |
| 5.004 | 0.388 |
| 5.005 | 0.388 |
| 5.006 | 0.387 |
| 5.007 | 0.386 |
| 5.008 | 0.386 |
| 5.009 | 0.385 |
| 5.01 | 0.384 |
| 5.011 | 0.384 |
| 5.012 | 0.383 |
| 5.013 | 0.382 |
| 5.014 | 0.381 |
| 5.015 | 0.381 |
| 5.016 | 0.38 |
| 5.017 | 0.379 |
| 5.018 | 0.379 |
| 5.019 | 0.378 |
| 5.02 | 0.377 |
| 5.021 | 0.377 |
| 5.022 | 0.376 |
| 5.023 | 0.375 |
| 5.024 | 0.375 |
| 5.025 | 0.374 |
| 5.026 | 0.373 |
| 5.027 | 0.372 |
| 5.028 | 0.372 |
| 5.029 | 0.371 |
| 5.03 | 0.37 |
| 5.031 | 0.37 |
| 5.032 | 0.369 |
| 5.033 | 0.368 |
| 5.034 | 0.368 |
| 5.035 | 0.367 |
| 5.036 | 0.366 |
| 5.037 | 0.366 |
| 5.038 | 0.365 |
| 5.039 | 0.365 |
| 5.04 | 0.364 |
| 5.041 | 0.363 |
| 5.042 | 0.363 |
| 5.043 | 0.362 |
| 5.044 | 0.361 |
| 5.045 | 0.361 |
| 5.046 | 0.36 |
| 5.047 | 0.359 |
| 5.048 | 0.359 |
| 5.049 | 0.358 |
| 5.05 | 0.358 |
| 5.051 | 0.357 |
| 5.052 | 0.356 |
| 5.053 | 0.356 |
| 5.054 | 0.355 |
| 5.055 | 0.354 |
| 5.056 | 0.354 |
| 5.057 | 0.353 |
| 5.058 | 0.353 |
| 5.059 | 0.352 |
| 5.06 | 0.351 |
| 5.061 | 0.351 |
| 5.062 | 0.35 |
| 5.063 | 0.349 |
| 5.064 | 0.349 |
| 5.065 | 0.348 |
| 5.066 | 0.348 |
| 5.067 | 0.347 |
| 5.068 | 0.346 |
| 5.069 | 0.346 |
| 5.07 | 0.345 |
| 5.071 | 0.345 |
| 5.072 | 0.344 |
| 5.073 | 0.344 |
| 5.074 | 0.343 |
| 5.075 | 0.342 |
| 5.076 | 0.342 |
| 5.077 | 0.341 |
| 5.078 | 0.341 |
| 5.079 | 0.34 |
| 5.08 | 0.339 |
| 5.081 | 0.339 |
| 5.082 | 0.338 |
| 5.083 | 0.338 |
| 5.084 | 0.337 |
| 5.085 | 0.337 |
| 5.086 | 0.336 |
| 5.087 | 0.336 |
| 5.088 | 0.335 |
| 5.089 | 0.334 |
| 5.09 | 0.334 |
| 5.091 | 0.333 |
| 5.092 | 0.333 |
| 5.093 | 0.332 |
| 5.094 | 0.332 |
| 5.095 | 0.331 |
| 5.096 | 0.331 |
| 5.097 | 0.33 |
| 5.098 | 0.33 |
| 5.099 | 0.329 |
| 5.1 | 0.328 |
| 5.101 | 0.328 |
| 5.102 | 0.327 |
| 5.103 | 0.327 |
| 5.104 | 0.326 |
| 5.105 | 0.326 |
| 5.106 | 0.325 |
| 5.107 | 0.325 |
| 5.108 | 0.324 |
| 5.109 | 0.324 |
| 5.11 | 0.323 |
| 5.111 | 0.323 |
| 5.112 | 0.322 |
| 5.113 | 0.322 |
| 5.114 | 0.321 |
| 5.115 | 0.321 |
| 5.116 | 0.32 |
| 5.117 | 0.32 |
| 5.118 | 0.319 |
| 5.119 | 0.319 |
| 5.12 | 0.318 |
| 5.121 | 0.318 |
| 5.122 | 0.317 |
| 5.123 | 0.317 |
| 5.124 | 0.316 |
| 5.125 | 0.316 |
| 5.126 | 0.315 |
| 5.127 | 0.315 |
| 5.128 | 0.314 |
| 5.129 | 0.314 |
| 5.13 | 0.313 |
| 5.131 | 0.313 |
| 5.132 | 0.312 |
| 5.133 | 0.312 |
| 5.134 | 0.312 |
| 5.135 | 0.311 |
| 5.136 | 0.311 |
| 5.137 | 0.31 |
| 5.138 | 0.31 |
| 5.139 | 0.309 |
| 5.14 | 0.309 |
| 5.141 | 0.308 |
| 5.142 | 0.308 |
| 5.143 | 0.307 |
| 5.144 | 0.307 |
| 5.145 | 0.307 |
| 5.146 | 0.306 |
| 5.147 | 0.306 |
| 5.148 | 0.305 |
| 5.149 | 0.305 |
| 5.15 | 0.304 |
| 5.151 | 0.304 |
| 5.152 | 0.304 |
| 5.153 | 0.303 |
| 5.154 | 0.303 |
| 5.155 | 0.302 |
| 5.156 | 0.302 |
| 5.157 | 0.301 |
| 5.158 | 0.301 |
| 5.159 | 0.301 |
| 5.16 | 0.3 |
| 5.161 | 0.3 |
| 5.162 | 0.299 |
| 5.163 | 0.299 |
| 5.164 | 0.299 |
| 5.165 | 0.298 |
| 5.166 | 0.298 |
| 5.167 | 0.297 |
| 5.168 | 0.297 |
| 5.169 | 0.297 |
| 5.17 | 0.296 |
| 5.171 | 0.296 |
| 5.172 | 0.295 |
| 5.173 | 0.295 |
| 5.174 | 0.295 |
| 5.175 | 0.294 |
| 5.176 | 0.294 |
| 5.177 | 0.294 |
| 5.178 | 0.293 |
| 5.179 | 0.293 |
| 5.18 | 0.292 |
| 5.181 | 0.292 |
| 5.182 | 0.292 |
| 5.183 | 0.291 |
| 5.184 | 0.291 |
| 5.185 | 0.291 |
| 5.186 | 0.29 |
| 5.187 | 0.29 |
| 5.188 | 0.29 |
| 5.189 | 0.289 |
| 5.19 | 0.289 |
| 5.191 | 0.289 |
| 5.192 | 0.288 |
| 5.193 | 0.288 |
| 5.194 | 0.288 |
| 5.195 | 0.287 |
| 5.196 | 0.287 |
| 5.197 | 0.287 |
| 5.198 | 0.286 |
| 5.199 | 0.286 |
| 5.2 | 0.286 |
| 5.201 | 0.285 |
| 5.202 | 0.285 |
| 5.203 | 0.285 |
| 5.204 | 0.284 |
| 5.205 | 0.284 |
| 5.206 | 0.284 |
| 5.207 | 0.283 |
| 5.208 | 0.283 |
| 5.209 | 0.283 |
| 5.21 | 0.282 |
| 5.211 | 0.282 |
| 5.212 | 0.282 |
| 5.213 | 0.282 |
| 5.214 | 0.281 |
| 5.215 | 0.281 |
| 5.216 | 0.281 |
| 5.217 | 0.28 |
| 5.218 | 0.28 |
| 5.219 | 0.28 |
| 5.22 | 0.279 |
| 5.221 | 0.279 |
| 5.222 | 0.279 |
| 5.223 | 0.279 |
| 5.224 | 0.278 |
| 5.225 | 0.278 |
| 5.226 | 0.278 |
| 5.227 | 0.278 |
| 5.228 | 0.277 |
| 5.229 | 0.277 |
| 5.23 | 0.277 |
| 5.231 | 0.277 |
| 5.232 | 0.276 |
| 5.233 | 0.276 |
| 5.234 | 0.276 |
| 5.235 | 0.275 |
| 5.236 | 0.275 |
| 5.237 | 0.275 |
| 5.238 | 0.275 |
| 5.239 | 0.275 |
| 5.24 | 0.274 |
| 5.241 | 0.274 |
| 5.242 | 0.274 |
| 5.243 | 0.274 |
| 5.244 | 0.273 |
| 5.245 | 0.273 |
| 5.246 | 0.273 |
| 5.247 | 0.273 |
| 5.248 | 0.272 |
| 5.249 | 0.272 |
| 5.25 | 0.272 |
| 5.251 | 0.272 |
| 5.252 | 0.272 |
| 5.253 | 0.271 |
| 5.254 | 0.271 |
| 5.255 | 0.271 |
| 5.256 | 0.271 |
| 5.257 | 0.27 |
| 5.258 | 0.27 |
| 5.259 | 0.27 |
| 5.26 | 0.27 |
| 5.261 | 0.27 |
| 5.262 | 0.27 |
| 5.263 | 0.269 |
| 5.264 | 0.269 |
| 5.265 | 0.269 |
| 5.266 | 0.269 |
| 5.267 | 0.269 |
| 5.268 | 0.268 |
| 5.269 | 0.268 |
| 5.27 | 0.268 |
| 5.271 | 0.268 |
| 5.272 | 0.268 |
| 5.273 | 0.268 |
| 5.274 | 0.267 |
| 5.275 | 0.267 |
| 5.276 | 0.267 |
| 5.277 | 0.267 |
| 5.278 | 0.267 |
| 5.279 | 0.267 |
| 5.28 | 0.266 |
| 5.281 | 0.266 |
| 5.282 | 0.266 |
| 5.283 | 0.266 |
| 5.284 | 0.266 |
| 5.285 | 0.266 |
| 5.286 | 0.266 |
| 5.287 | 0.265 |
| 5.288 | 0.265 |
| 5.289 | 0.265 |
| 5.29 | 0.265 |
| 5.291 | 0.265 |
| 5.292 | 0.265 |
| 5.293 | 0.265 |
| 5.294 | 0.264 |
| 5.295 | 0.264 |
| 5.296 | 0.264 |
| 5.297 | 0.264 |
| 5.298 | 0.264 |
| 5.299 | 0.264 |
| 5.3 | 0.264 |
| 5.301 | 0.264 |
| 5.302 | 0.264 |
| 5.303 | 0.263 |
| 5.304 | 0.263 |
| 5.305 | 0.263 |
| 5.306 | 0.263 |
| 5.307 | 0.263 |
| 5.308 | 0.263 |
| 5.309 | 0.263 |
| 5.31 | 0.263 |
| 5.311 | 0.263 |
| 5.312 | 0.263 |
| 5.313 | 0.262 |
| 5.314 | 0.262 |
| 5.315 | 0.262 |
| 5.316 | 0.262 |
| 5.317 | 0.262 |
| 5.318 | 0.262 |
| 5.319 | 0.262 |
| 5.32 | 0.262 |
| 5.321 | 0.262 |
| 5.322 | 0.262 |
| 5.323 | 0.262 |
| 5.324 | 0.262 |
| 5.325 | 0.262 |
| 5.326 | 0.262 |
| 5.327 | 0.262 |
| 5.328 | 0.262 |
| 5.329 | 0.261 |
| 5.33 | 0.261 |
| 5.331 | 0.261 |
| 5.332 | 0.261 |
| 5.333 | 0.261 |
| 5.334 | 0.261 |
| 5.335 | 0.261 |
| 5.336 | 0.261 |
| 5.337 | 0.261 |
| 5.338 | 0.261 |
| 5.339 | 0.261 |
| 5.34 | 0.261 |
| 5.341 | 0.261 |
| 5.342 | 0.261 |
| 5.343 | 0.261 |
| 5.344 | 0.261 |
| 5.345 | 0.261 |
| 5.346 | 0.261 |
| 5.347 | 0.261 |
| 5.348 | 0.261 |
| 5.349 | 0.261 |
| 5.35 | 0.261 |
| 5.351 | 0.261 |
| 5.352 | 0.261 |
| 5.353 | 0.261 |
| 5.354 | 0.261 |
| 5.355 | 0.261 |
| 5.356 | 0.261 |
| 5.357 | 0.261 |
| 5.358 | 0.261 |
| 5.359 | 0.261 |
| 5.36 | 0.261 |
| 5.361 | 0.261 |
| 5.362 | 0.261 |
| 5.363 | 0.261 |
| 5.364 | 0.261 |
| 5.365 | 0.261 |
| 5.366 | 0.261 |
| 5.367 | 0.261 |
| 5.368 | 0.261 |
| 5.369 | 0.261 |
| 5.37 | 0.261 |
| 5.371 | 0.261 |
| 5.372 | 0.261 |
| 5.373 | 0.261 |
| 5.374 | 0.261 |
| 5.375 | 0.262 |
| 5.376 | 0.262 |
| 5.377 | 0.262 |
| 5.378 | 0.262 |
| 5.379 | 0.262 |
| 5.38 | 0.262 |
| 5.381 | 0.262 |
| 5.382 | 0.262 |
| 5.383 | 0.262 |
| 5.384 | 0.262 |
| 5.385 | 0.262 |
| 5.386 | 0.262 |
| 5.387 | 0.262 |
| 5.388 | 0.262 |
| 5.389 | 0.262 |
| 5.39 | 0.263 |
| 5.391 | 0.263 |
| 5.392 | 0.263 |
| 5.393 | 0.263 |
| 5.394 | 0.263 |
| 5.395 | 0.263 |
| 5.396 | 0.263 |
| 5.397 | 0.263 |
| 5.398 | 0.263 |
| 5.399 | 0.263 |
| 5.4 | 0.264 |
| 5.401 | 0.264 |
| 5.402 | 0.264 |
| 5.403 | 0.264 |
| 5.404 | 0.264 |
| 5.405 | 0.264 |
| 5.406 | 0.264 |
| 5.407 | 0.264 |
| 5.408 | 0.264 |
| 5.409 | 0.265 |
| 5.41 | 0.265 |
| 5.411 | 0.265 |
| 5.412 | 0.265 |
| 5.413 | 0.265 |
| 5.414 | 0.265 |
| 5.415 | 0.265 |
| 5.416 | 0.265 |
| 5.417 | 0.266 |
| 5.418 | 0.266 |
| 5.419 | 0.266 |
| 5.42 | 0.266 |
| 5.421 | 0.266 |
| 5.422 | 0.266 |
| 5.423 | 0.266 |
| 5.424 | 0.267 |
| 5.425 | 0.267 |
| 5.426 | 0.267 |
| 5.427 | 0.267 |
| 5.428 | 0.267 |
| 5.429 | 0.267 |
| 5.43 | 0.268 |
| 5.431 | 0.268 |
| 5.432 | 0.268 |
| 5.433 | 0.268 |
| 5.434 | 0.268 |
| 5.435 | 0.268 |
| 5.436 | 0.269 |
| 5.437 | 0.269 |
| 5.438 | 0.269 |
| 5.439 | 0.269 |
| 5.44 | 0.269 |
| 5.441 | 0.27 |
| 5.442 | 0.27 |
| 5.443 | 0.27 |
| 5.444 | 0.27 |
| 5.445 | 0.27 |
| 5.446 | 0.27 |
| 5.447 | 0.271 |
| 5.448 | 0.271 |
| 5.449 | 0.271 |
| 5.45 | 0.271 |
| 5.451 | 0.272 |
| 5.452 | 0.272 |
| 5.453 | 0.272 |
| 5.454 | 0.272 |
| 5.455 | 0.272 |
| 5.456 | 0.273 |
| 5.457 | 0.273 |
| 5.458 | 0.273 |
| 5.459 | 0.273 |
| 5.46 | 0.274 |
| 5.461 | 0.274 |
| 5.462 | 0.274 |
| 5.463 | 0.274 |
| 5.464 | 0.274 |
| 5.465 | 0.275 |
| 5.466 | 0.275 |
| 5.467 | 0.275 |
| 5.468 | 0.275 |
| 5.469 | 0.276 |
| 5.47 | 0.276 |
| 5.471 | 0.276 |
| 5.472 | 0.276 |
| 5.473 | 0.277 |
| 5.474 | 0.277 |
| 5.475 | 0.277 |
| 5.476 | 0.277 |
| 5.477 | 0.278 |
| 5.478 | 0.278 |
| 5.479 | 0.278 |
| 5.48 | 0.279 |
| 5.481 | 0.279 |
| 5.482 | 0.279 |
| 5.483 | 0.279 |
| 5.484 | 0.28 |
| 5.485 | 0.28 |
| 5.486 | 0.28 |
| 5.487 | 0.281 |
| 5.488 | 0.281 |
| 5.489 | 0.281 |
| 5.49 | 0.281 |
| 5.491 | 0.282 |
| 5.492 | 0.282 |
| 5.493 | 0.282 |
| 5.494 | 0.283 |
| 5.495 | 0.283 |
| 5.496 | 0.283 |
| 5.497 | 0.284 |
| 5.498 | 0.284 |
| 5.499 | 0.284 |
| 5.5 | 0.284 |
| 5.501 | 0.285 |
| 5.502 | 0.285 |
| 5.503 | 0.285 |
| 5.504 | 0.286 |
| 5.505 | 0.286 |
| 5.506 | 0.286 |
| 5.507 | 0.286 |
| 5.508 | 0.287 |
| 5.509 | 0.287 |
| 5.51 | 0.287 |
| 5.511 | 0.288 |
| 5.512 | 0.288 |
| 5.513 | 0.288 |
| 5.514 | 0.289 |
| 5.515 | 0.289 |
| 5.516 | 0.289 |
| 5.517 | 0.29 |
| 5.518 | 0.29 |
| 5.519 | 0.29 |
| 5.52 | 0.291 |
| 5.521 | 0.291 |
| 5.522 | 0.291 |
| 5.523 | 0.292 |
| 5.524 | 0.292 |
| 5.525 | 0.292 |
| 5.526 | 0.293 |
| 5.527 | 0.293 |
| 5.528 | 0.293 |
| 5.529 | 0.294 |
| 5.53 | 0.294 |
| 5.531 | 0.294 |
| 5.532 | 0.295 |
| 5.533 | 0.295 |
| 5.534 | 0.295 |
| 5.535 | 0.296 |
| 5.536 | 0.296 |
| 5.537 | 0.296 |
| 5.538 | 0.297 |
| 5.539 | 0.297 |
| 5.54 | 0.298 |
| 5.541 | 0.298 |
| 5.542 | 0.298 |
| 5.543 | 0.299 |
| 5.544 | 0.299 |
| 5.545 | 0.299 |
| 5.546 | 0.3 |
| 5.547 | 0.3 |
| 5.548 | 0.301 |
| 5.549 | 0.301 |
| 5.55 | 0.301 |
| 5.551 | 0.302 |
| 5.552 | 0.302 |
| 5.553 | 0.303 |
| 5.554 | 0.303 |
| 5.555 | 0.303 |
| 5.556 | 0.304 |
| 5.557 | 0.304 |
| 5.558 | 0.305 |
| 5.559 | 0.305 |
| 5.56 | 0.305 |
| 5.561 | 0.306 |
| 5.562 | 0.306 |
| 5.563 | 0.307 |
| 5.564 | 0.307 |
| 5.565 | 0.308 |
| 5.566 | 0.308 |
| 5.567 | 0.308 |
| 5.568 | 0.309 |
| 5.569 | 0.309 |
| 5.57 | 0.31 |
| 5.571 | 0.31 |
| 5.572 | 0.311 |
| 5.573 | 0.311 |
| 5.574 | 0.312 |
| 5.575 | 0.312 |
| 5.576 | 0.312 |
| 5.577 | 0.313 |
| 5.578 | 0.313 |
| 5.579 | 0.314 |
| 5.58 | 0.314 |
| 5.581 | 0.315 |
| 5.582 | 0.315 |
| 5.583 | 0.316 |
| 5.584 | 0.316 |
| 5.585 | 0.317 |
| 5.586 | 0.317 |
| 5.587 | 0.318 |
| 5.588 | 0.318 |
| 5.589 | 0.319 |
| 5.59 | 0.319 |
| 5.591 | 0.32 |
| 5.592 | 0.32 |
| 5.593 | 0.32 |
| 5.594 | 0.321 |
| 5.595 | 0.321 |
| 5.596 | 0.322 |
| 5.597 | 0.322 |
| 5.598 | 0.323 |
| 5.599 | 0.324 |
| 5.6 | 0.324 |
| 5.601 | 0.325 |
| 5.602 | 0.325 |
| 5.603 | 0.326 |
| 5.604 | 0.326 |
| 5.605 | 0.327 |
| 5.606 | 0.327 |
| 5.607 | 0.328 |
| 5.608 | 0.328 |
| 5.609 | 0.329 |
| 5.61 | 0.329 |
| 5.611 | 0.33 |
| 5.612 | 0.33 |
| 5.613 | 0.331 |
| 5.614 | 0.331 |
| 5.615 | 0.332 |
| 5.616 | 0.332 |
| 5.617 | 0.333 |
| 5.618 | 0.334 |
| 5.619 | 0.334 |
| 5.62 | 0.335 |
| 5.621 | 0.335 |
| 5.622 | 0.336 |
| 5.623 | 0.336 |
| 5.624 | 0.337 |
| 5.625 | 0.338 |
| 5.626 | 0.338 |
| 5.627 | 0.339 |
| 5.628 | 0.339 |
| 5.629 | 0.34 |
| 5.63 | 0.34 |
| 5.631 | 0.341 |
| 5.632 | 0.342 |
| 5.633 | 0.342 |
| 5.634 | 0.343 |
| 5.635 | 0.343 |
| 5.636 | 0.344 |
| 5.637 | 0.344 |
| 5.638 | 0.345 |
| 5.639 | 0.346 |
| 5.64 | 0.346 |
| 5.641 | 0.347 |
| 5.642 | 0.347 |
| 5.643 | 0.348 |
| 5.644 | 0.349 |
| 5.645 | 0.349 |
| 5.646 | 0.35 |
| 5.647 | 0.351 |
| 5.648 | 0.351 |
| 5.649 | 0.352 |
| 5.65 | 0.352 |
| 5.651 | 0.353 |
| 5.652 | 0.354 |
| 5.653 | 0.354 |
| 5.654 | 0.355 |
| 5.655 | 0.356 |
| 5.656 | 0.356 |
| 5.657 | 0.357 |
| 5.658 | 0.357 |
| 5.659 | 0.358 |
| 5.66 | 0.359 |
| 5.661 | 0.359 |
| 5.662 | 0.36 |
| 5.663 | 0.361 |
| 5.664 | 0.361 |
| 5.665 | 0.362 |
| 5.666 | 0.363 |
| 5.667 | 0.363 |
| 5.668 | 0.364 |
| 5.669 | 0.365 |
| 5.67 | 0.365 |
| 5.671 | 0.366 |
| 5.672 | 0.367 |
| 5.673 | 0.367 |
| 5.674 | 0.368 |
| 5.675 | 0.369 |
| 5.676 | 0.369 |
| 5.677 | 0.37 |
| 5.678 | 0.371 |
| 5.679 | 0.372 |
| 5.68 | 0.372 |
| 5.681 | 0.373 |
| 5.682 | 0.374 |
| 5.683 | 0.374 |
| 5.684 | 0.375 |
| 5.685 | 0.376 |
| 5.686 | 0.376 |
| 5.687 | 0.377 |
| 5.688 | 0.378 |
| 5.689 | 0.379 |
| 5.69 | 0.379 |
| 5.691 | 0.38 |
| 5.692 | 0.381 |
| 5.693 | 0.381 |
| 5.694 | 0.382 |
| 5.695 | 0.383 |
| 5.696 | 0.384 |
| 5.697 | 0.384 |
| 5.698 | 0.385 |
| 5.699 | 0.386 |
| 5.7 | 0.387 |
| 5.701 | 0.387 |
| 5.702 | 0.388 |
| 5.703 | 0.389 |
| 5.704 | 0.39 |
| 5.705 | 0.39 |
| 5.706 | 0.391 |
| 5.707 | 0.392 |
| 5.708 | 0.393 |
| 5.709 | 0.393 |
| 5.71 | 0.394 |
| 5.711 | 0.395 |
| 5.712 | 0.396 |
| 5.713 | 0.396 |
| 5.714 | 0.397 |
| 5.715 | 0.398 |
| 5.716 | 0.399 |
| 5.717 | 0.399 |
| 5.718 | 0.4 |
| 5.719 | 0.401 |
| 5.72 | 0.402 |
| 5.721 | 0.403 |
| 5.722 | 0.403 |
| 5.723 | 0.404 |
| 5.724 | 0.405 |
| 5.725 | 0.406 |
| 5.726 | 0.406 |
| 5.727 | 0.407 |
| 5.728 | 0.408 |
| 5.729 | 0.409 |
| 5.73 | 0.41 |
| 5.731 | 0.411 |
| 5.732 | 0.411 |
| 5.733 | 0.412 |
| 5.734 | 0.413 |
| 5.735 | 0.414 |
| 5.736 | 0.415 |
| 5.737 | 0.415 |
| 5.738 | 0.416 |
| 5.739 | 0.417 |
| 5.74 | 0.418 |
| 5.741 | 0.419 |
| 5.742 | 0.42 |
| 5.743 | 0.42 |
| 5.744 | 0.421 |
| 5.745 | 0.422 |
| 5.746 | 0.423 |
| 5.747 | 0.424 |
| 5.748 | 0.425 |
| 5.749 | 0.425 |
| 5.75 | 0.426 |
| 5.751 | 0.427 |
| 5.752 | 0.428 |
| 5.753 | 0.429 |
| 5.754 | 0.43 |
| 5.755 | 0.43 |
| 5.756 | 0.431 |
| 5.757 | 0.432 |
| 5.758 | 0.433 |
| 5.759 | 0.434 |
| 5.76 | 0.435 |
| 5.761 | 0.436 |
| 5.762 | 0.437 |
| 5.763 | 0.437 |
| 5.764 | 0.438 |
| 5.765 | 0.439 |
| 5.766 | 0.44 |
| 5.767 | 0.441 |
| 5.768 | 0.442 |
| 5.769 | 0.443 |
| 5.77 | 0.444 |
| 5.771 | 0.444 |
| 5.772 | 0.445 |
| 5.773 | 0.446 |
| 5.774 | 0.447 |
| 5.775 | 0.448 |
| 5.776 | 0.449 |
| 5.777 | 0.45 |
| 5.778 | 0.451 |
| 5.779 | 0.452 |
| 5.78 | 0.453 |
| 5.781 | 0.454 |
| 5.782 | 0.454 |
| 5.783 | 0.455 |
| 5.784 | 0.456 |
| 5.785 | 0.457 |
| 5.786 | 0.458 |
| 5.787 | 0.459 |
| 5.788 | 0.46 |
| 5.789 | 0.461 |
| 5.79 | 0.462 |
| 5.791 | 0.463 |
| 5.792 | 0.464 |
| 5.793 | 0.465 |
| 5.794 | 0.466 |
| 5.795 | 0.466 |
| 5.796 | 0.467 |
| 5.797 | 0.468 |
| 5.798 | 0.469 |
| 5.799 | 0.47 |
| 5.8 | 0.471 |
| 5.801 | 0.472 |
| 5.802 | 0.473 |
| 5.803 | 0.474 |
| 5.804 | 0.475 |
| 5.805 | 0.476 |
| 5.806 | 0.477 |
| 5.807 | 0.478 |
| 5.808 | 0.479 |
| 5.809 | 0.48 |
| 5.81 | 0.481 |
| 5.811 | 0.482 |
| 5.812 | 0.483 |
| 5.813 | 0.484 |
| 5.814 | 0.485 |
| 5.815 | 0.486 |
| 5.816 | 0.487 |
| 5.817 | 0.487 |
| 5.818 | 0.488 |
| 5.819 | 0.489 |
| 5.82 | 0.49 |
| 5.821 | 0.491 |
| 5.822 | 0.492 |
| 5.823 | 0.493 |
| 5.824 | 0.494 |
| 5.825 | 0.495 |
| 5.826 | 0.496 |
| 5.827 | 0.497 |
| 5.828 | 0.498 |
| 5.829 | 0.499 |
| 5.83 | 0.5 |
| 5.831 | 0.501 |
| 5.832 | 0.502 |
| 5.833 | 0.503 |
| 5.834 | 0.504 |
| 5.835 | 0.505 |
| 5.836 | 0.506 |
| 5.837 | 0.507 |
| 5.838 | 0.508 |
| 5.839 | 0.509 |
| 5.84 | 0.51 |
| 5.841 | 0.511 |
| 5.842 | 0.512 |
| 5.843 | 0.513 |
| 5.844 | 0.514 |
| 5.845 | 0.516 |
| 5.846 | 0.517 |
| 5.847 | 0.518 |
| 5.848 | 0.519 |
| 5.849 | 0.52 |
| 5.85 | 0.521 |
| 5.851 | 0.522 |
| 5.852 | 0.523 |
| 5.853 | 0.524 |
| 5.854 | 0.525 |
| 5.855 | 0.526 |
| 5.856 | 0.527 |
| 5.857 | 0.528 |
| 5.858 | 0.529 |
| 5.859 | 0.53 |
| 5.86 | 0.531 |
| 5.861 | 0.532 |
| 5.862 | 0.533 |
| 5.863 | 0.535 |
| 5.864 | 0.536 |
| 5.865 | 0.537 |
| 5.866 | 0.538 |
| 5.867 | 0.539 |
| 5.868 | 0.54 |
| 5.869 | 0.541 |
| 5.87 | 0.542 |
| 5.871 | 0.543 |
| 5.872 | 0.544 |
| 5.873 | 0.545 |
| 5.874 | 0.546 |
| 5.875 | 0.548 |
| 5.876 | 0.549 |
| 5.877 | 0.55 |
| 5.878 | 0.551 |
| 5.879 | 0.552 |
| 5.88 | 0.553 |
| 5.881 | 0.554 |
| 5.882 | 0.555 |
| 5.883 | 0.556 |
| 5.884 | 0.558 |
| 5.885 | 0.559 |
| 5.886 | 0.56 |
| 5.887 | 0.561 |
| 5.888 | 0.562 |
| 5.889 | 0.563 |
| 5.89 | 0.564 |
| 5.891 | 0.566 |
| 5.892 | 0.567 |
| 5.893 | 0.568 |
| 5.894 | 0.569 |
| 5.895 | 0.57 |
| 5.896 | 0.571 |
| 5.897 | 0.572 |
| 5.898 | 0.574 |
| 5.899 | 0.575 |
| 5.9 | 0.576 |
| 5.901 | 0.577 |
| 5.902 | 0.578 |
| 5.903 | 0.579 |
| 5.904 | 0.58 |
| 5.905 | 0.582 |
| 5.906 | 0.583 |
| 5.907 | 0.584 |
| 5.908 | 0.585 |
| 5.909 | 0.586 |
| 5.91 | 0.587 |
| 5.911 | 0.589 |
| 5.912 | 0.59 |
| 5.913 | 0.591 |
| 5.914 | 0.592 |
| 5.915 | 0.593 |
| 5.916 | 0.594 |
| 5.917 | 0.596 |
| 5.918 | 0.597 |
| 5.919 | 0.598 |
| 5.92 | 0.599 |
| 5.921 | 0.6 |
| 5.922 | 0.602 |
| 5.923 | 0.603 |
| 5.924 | 0.604 |
| 5.925 | 0.605 |
| 5.926 | 0.606 |
| 5.927 | 0.608 |
| 5.928 | 0.609 |
| 5.929 | 0.61 |
| 5.93 | 0.611 |
| 5.931 | 0.612 |
| 5.932 | 0.614 |
| 5.933 | 0.615 |
| 5.934 | 0.616 |
| 5.935 | 0.617 |
| 5.936 | 0.619 |
| 5.937 | 0.62 |
| 5.938 | 0.621 |
| 5.939 | 0.622 |
| 5.94 | 0.623 |
| 5.941 | 0.625 |
| 5.942 | 0.626 |
| 5.943 | 0.627 |
| 5.944 | 0.628 |
| 5.945 | 0.63 |
| 5.946 | 0.631 |
| 5.947 | 0.632 |
| 5.948 | 0.633 |
| 5.949 | 0.635 |
| 5.95 | 0.636 |
| 5.951 | 0.637 |
| 5.952 | 0.638 |
| 5.953 | 0.64 |
| 5.954 | 0.641 |
| 5.955 | 0.642 |
| 5.956 | 0.643 |
| 5.957 | 0.645 |
| 5.958 | 0.646 |
| 5.959 | 0.647 |
| 5.96 | 0.648 |
| 5.961 | 0.65 |
| 5.962 | 0.651 |
| 5.963 | 0.652 |
| 5.964 | 0.653 |
| 5.965 | 0.655 |
| 5.966 | 0.656 |
| 5.967 | 0.657 |
| 5.968 | 0.659 |
| 5.969 | 0.66 |
| 5.97 | 0.661 |
| 5.971 | 0.662 |
| 5.972 | 0.664 |
| 5.973 | 0.665 |
| 5.974 | 0.666 |
| 5.975 | 0.668 |
| 5.976 | 0.669 |
| 5.977 | 0.67 |
| 5.978 | 0.672 |
| 5.979 | 0.673 |
| 5.98 | 0.674 |
| 5.981 | 0.675 |
| 5.982 | 0.677 |
| 5.983 | 0.678 |
| 5.984 | 0.679 |
| 5.985 | 0.681 |
| 5.986 | 0.682 |
| 5.987 | 0.683 |
| 5.988 | 0.685 |
| 5.989 | 0.686 |
| 5.99 | 0.687 |
| 5.991 | 0.689 |
| 5.992 | 0.69 |
| 5.993 | 0.691 |
| 5.994 | 0.693 |
| 5.995 | 0.694 |
| 5.996 | 0.695 |
| 5.997 | 0.697 |
| 5.998 | 0.698 |
| 5.999 | 0.699 |
| 6.0 | 0.701 |
| 6.001 | 0.702 |
| 6.002 | 0.703 |
| 6.003 | 0.705 |
| 6.004 | 0.706 |
| 6.005 | 0.707 |
| 6.006 | 0.709 |
| 6.007 | 0.71 |
| 6.008 | 0.711 |
| 6.009 | 0.713 |
| 6.01 | 0.714 |
| 6.011 | 0.715 |
| 6.012 | 0.717 |
| 6.013 | 0.718 |
| 6.014 | 0.719 |
| 6.015 | 0.721 |
| 6.016 | 0.722 |
| 6.017 | 0.723 |
| 6.018 | 0.725 |
| 6.019 | 0.726 |
| 6.02 | 0.727 |
| 6.021 | 0.729 |
| 6.022 | 0.73 |
| 6.023 | 0.732 |
| 6.024 | 0.733 |
| 6.025 | 0.734 |
| 6.026 | 0.736 |
| 6.027 | 0.737 |
| 6.028 | 0.738 |
| 6.029 | 0.74 |
| 6.03 | 0.741 |
| 6.031 | 0.743 |
| 6.032 | 0.744 |
| 6.033 | 0.745 |
| 6.034 | 0.747 |
| 6.035 | 0.748 |
| 6.036 | 0.75 |
| 6.037 | 0.751 |
| 6.038 | 0.752 |
| 6.039 | 0.754 |
| 6.04 | 0.755 |
| 6.041 | 0.757 |
| 6.042 | 0.758 |
| 6.043 | 0.759 |
| 6.044 | 0.761 |
| 6.045 | 0.762 |
| 6.046 | 0.764 |
| 6.047 | 0.765 |
| 6.048 | 0.766 |
| 6.049 | 0.768 |
| 6.05 | 0.769 |
| 6.051 | 0.771 |
| 6.052 | 0.772 |
| 6.053 | 0.773 |
| 6.054 | 0.775 |
| 6.055 | 0.776 |
| 6.056 | 0.778 |
| 6.057 | 0.779 |
| 6.058 | 0.781 |
| 6.059 | 0.782 |
| 6.06 | 0.783 |
| 6.061 | 0.785 |
| 6.062 | 0.786 |
| 6.063 | 0.788 |
| 6.064 | 0.789 |
| 6.065 | 0.791 |
| 6.066 | 0.792 |
| 6.067 | 0.794 |
| 6.068 | 0.795 |
| 6.069 | 0.797 |
| 6.07 | 0.798 |
| 6.071 | 0.799 |
| 6.072 | 0.801 |
| 6.073 | 0.802 |
| 6.074 | 0.804 |
| 6.075 | 0.805 |
| 6.076 | 0.807 |
| 6.077 | 0.808 |
| 6.078 | 0.81 |
| 6.079 | 0.811 |
| 6.08 | 0.813 |
| 6.081 | 0.814 |
| 6.082 | 0.816 |
| 6.083 | 0.817 |
| 6.084 | 0.819 |
| 6.085 | 0.82 |
| 6.086 | 0.822 |
| 6.087 | 0.823 |
| 6.088 | 0.825 |
| 6.089 | 0.826 |
| 6.09 | 0.828 |
| 6.091 | 0.829 |
| 6.092 | 0.831 |
| 6.093 | 0.832 |
| 6.094 | 0.834 |
| 6.095 | 0.835 |
| 6.096 | 0.837 |
| 6.097 | 0.838 |
| 6.098 | 0.84 |
| 6.099 | 0.841 |
| 6.1 | 0.843 |
| 6.101 | 0.844 |
| 6.102 | 0.846 |
| 6.103 | 0.847 |
| 6.104 | 0.849 |
| 6.105 | 0.85 |
| 6.106 | 0.852 |
| 6.107 | 0.853 |
| 6.108 | 0.855 |
| 6.109 | 0.856 |
| 6.11 | 0.858 |
| 6.111 | 0.86 |
| 6.112 | 0.861 |
| 6.113 | 0.863 |
| 6.114 | 0.864 |
| 6.115 | 0.866 |
| 6.116 | 0.867 |
| 6.117 | 0.869 |
| 6.118 | 0.87 |
| 6.119 | 0.872 |
| 6.12 | 0.873 |
| 6.121 | 0.875 |
| 6.122 | 0.876 |
| 6.123 | 0.878 |
| 6.124 | 0.88 |
| 6.125 | 0.881 |
| 6.126 | 0.883 |
| 6.127 | 0.884 |
| 6.128 | 0.886 |
| 6.129 | 0.887 |
| 6.13 | 0.889 |
| 6.131 | 0.891 |
| 6.132 | 0.892 |
| 6.133 | 0.894 |
| 6.134 | 0.895 |
| 6.135 | 0.897 |
| 6.136 | 0.898 |
| 6.137 | 0.9 |
| 6.138 | 0.902 |
| 6.139 | 0.903 |
| 6.14 | 0.905 |
| 6.141 | 0.906 |
| 6.142 | 0.908 |
| 6.143 | 0.909 |
| 6.144 | 0.911 |
| 6.145 | 0.913 |
| 6.146 | 0.914 |
| 6.147 | 0.916 |
| 6.148 | 0.917 |
| 6.149 | 0.919 |
| 6.15 | 0.921 |
| 6.151 | 0.922 |
| 6.152 | 0.924 |
| 6.153 | 0.925 |
| 6.154 | 0.927 |
| 6.155 | 0.929 |
| 6.156 | 0.93 |
| 6.157 | 0.932 |
| 6.158 | 0.933 |
| 6.159 | 0.935 |
| 6.16 | 0.937 |
| 6.161 | 0.938 |
| 6.162 | 0.94 |
| 6.163 | 0.942 |
| 6.164 | 0.943 |
| 6.165 | 0.945 |
| 6.166 | 0.946 |
| 6.167 | 0.948 |
| 6.168 | 0.95 |
| 6.169 | 0.951 |
| 6.17 | 0.953 |
| 6.171 | 0.955 |
| 6.172 | 0.956 |
| 6.173 | 0.958 |
| 6.174 | 0.959 |
| 6.175 | 0.961 |
| 6.176 | 0.963 |
| 6.177 | 0.964 |
| 6.178 | 0.966 |
| 6.179 | 0.968 |
| 6.18 | 0.969 |
| 6.181 | 0.971 |
| 6.182 | 0.973 |
| 6.183 | 0.974 |
| 6.184 | 0.976 |
| 6.185 | 0.978 |
| 6.186 | 0.979 |
| 6.187 | 0.981 |
| 6.188 | 0.982 |
| 6.189 | 0.984 |
| 6.19 | 0.986 |
| 6.191 | 0.987 |
| 6.192 | 0.989 |
| 6.193 | 0.991 |
| 6.194 | 0.992 |
| 6.195 | 0.994 |
| 6.196 | 0.996 |
| 6.197 | 0.997 |
| 6.198 | 0.999 |
| 6.199 | 1.001 |
| 6.2 | 1.002 |
| 6.201 | 1.004 |
| 6.202 | 1.006 |
| 6.203 | 1.007 |
| 6.204 | 1.009 |
| 6.205 | 1.011 |
| 6.206 | 1.012 |
| 6.207 | 1.014 |
| 6.208 | 1.016 |
| 6.209 | 1.017 |
| 6.21 | 1.019 |
| 6.211 | 1.021 |
| 6.212 | 1.022 |
| 6.213 | 1.024 |
| 6.214 | 1.026 |
| 6.215 | 1.028 |
| 6.216 | 1.029 |
| 6.217 | 1.031 |
| 6.218 | 1.033 |
| 6.219 | 1.034 |
| 6.22 | 1.036 |
| 6.221 | 1.038 |
| 6.222 | 1.039 |
| 6.223 | 1.041 |
| 6.224 | 1.043 |
| 6.225 | 1.044 |
| 6.226 | 1.046 |
| 6.227 | 1.048 |
| 6.228 | 1.049 |
| 6.229 | 1.051 |
| 6.23 | 1.053 |
| 6.231 | 1.055 |
| 6.232 | 1.056 |
| 6.233 | 1.058 |
| 6.234 | 1.06 |
| 6.235 | 1.061 |
| 6.236 | 1.063 |
| 6.237 | 1.065 |
| 6.238 | 1.066 |
| 6.239 | 1.068 |
| 6.24 | 1.07 |
| 6.241 | 1.072 |
| 6.242 | 1.073 |
| 6.243 | 1.075 |
| 6.244 | 1.077 |
| 6.245 | 1.078 |
| 6.246 | 1.08 |
| 6.247 | 1.082 |
| 6.248 | 1.084 |
| 6.249 | 1.085 |
| 6.25 | 1.087 |
| 6.251 | 1.089 |
| 6.252 | 1.091 |
| 6.253 | 1.092 |
| 6.254 | 1.094 |
| 6.255 | 1.096 |
| 6.256 | 1.098 |
| 6.257 | 1.099 |
| 6.258 | 1.101 |
| 6.259 | 1.103 |
| 6.26 | 1.104 |
| 6.261 | 1.106 |
| 6.262 | 1.108 |
| 6.263 | 1.11 |
| 6.264 | 1.111 |
| 6.265 | 1.113 |
| 6.266 | 1.115 |
| 6.267 | 1.117 |
| 6.268 | 1.118 |
| 6.269 | 1.12 |
| 6.27 | 1.122 |
| 6.271 | 1.124 |
| 6.272 | 1.125 |
| 6.273 | 1.127 |
| 6.274 | 1.129 |
| 6.275 | 1.131 |
| 6.276 | 1.133 |
| 6.277 | 1.134 |
| 6.278 | 1.136 |
| 6.279 | 1.138 |
| 6.28 | 1.14 |
| 6.281 | 1.141 |
| 6.282 | 1.143 |
| 6.283 | 1.145 |
| 6.284 | 1.147 |
| 6.285 | 1.149 |
| 6.286 | 1.15 |
| 6.287 | 1.152 |
| 6.288 | 1.154 |
| 6.289 | 1.156 |
| 6.29 | 1.158 |
| 6.291 | 1.159 |
| 6.292 | 1.161 |
| 6.293 | 1.163 |
| 6.294 | 1.165 |
| 6.295 | 1.167 |
| 6.296 | 1.168 |
| 6.297 | 1.17 |
| 6.298 | 1.172 |
| 6.299 | 1.174 |
| 6.3 | 1.176 |
| 6.301 | 1.177 |
| 6.302 | 1.179 |
| 6.303 | 1.181 |
| 6.304 | 1.183 |
| 6.305 | 1.185 |
| 6.306 | 1.187 |
| 6.307 | 1.188 |
| 6.308 | 1.19 |
| 6.309 | 1.192 |
| 6.31 | 1.194 |
| 6.311 | 1.196 |
| 6.312 | 1.197 |
| 6.313 | 1.199 |
| 6.314 | 1.201 |
| 6.315 | 1.203 |
| 6.316 | 1.205 |
| 6.317 | 1.207 |
| 6.318 | 1.208 |
| 6.319 | 1.21 |
| 6.32 | 1.212 |
| 6.321 | 1.214 |
| 6.322 | 1.216 |
| 6.323 | 1.218 |
| 6.324 | 1.22 |
| 6.325 | 1.221 |
| 6.326 | 1.223 |
| 6.327 | 1.225 |
| 6.328 | 1.227 |
| 6.329 | 1.229 |
| 6.33 | 1.231 |
| 6.331 | 1.232 |
| 6.332 | 1.234 |
| 6.333 | 1.236 |
| 6.334 | 1.238 |
| 6.335 | 1.24 |
| 6.336 | 1.242 |
| 6.337 | 1.244 |
| 6.338 | 1.245 |
| 6.339 | 1.247 |
| 6.34 | 1.249 |
| 6.341 | 1.251 |
| 6.342 | 1.253 |
| 6.343 | 1.255 |
| 6.344 | 1.257 |
| 6.345 | 1.259 |
| 6.346 | 1.26 |
| 6.347 | 1.262 |
| 6.348 | 1.264 |
| 6.349 | 1.266 |
| 6.35 | 1.268 |
| 6.351 | 1.27 |
| 6.352 | 1.272 |
| 6.353 | 1.274 |
| 6.354 | 1.275 |
| 6.355 | 1.277 |
| 6.356 | 1.279 |
| 6.357 | 1.281 |
| 6.358 | 1.283 |
| 6.359 | 1.285 |
| 6.36 | 1.287 |
| 6.361 | 1.289 |
| 6.362 | 1.291 |
| 6.363 | 1.292 |
| 6.364 | 1.294 |
| 6.365 | 1.296 |
| 6.366 | 1.298 |
| 6.367 | 1.3 |
| 6.368 | 1.302 |
| 6.369 | 1.304 |
| 6.37 | 1.306 |
| 6.371 | 1.308 |
| 6.372 | 1.31 |
| 6.373 | 1.311 |
| 6.374 | 1.313 |
| 6.375 | 1.315 |
| 6.376 | 1.317 |
| 6.377 | 1.319 |
| 6.378 | 1.321 |
| 6.379 | 1.323 |
| 6.38 | 1.325 |
| 6.381 | 1.327 |
| 6.382 | 1.329 |
| 6.383 | 1.331 |
| 6.384 | 1.333 |
| 6.385 | 1.334 |
| 6.386 | 1.336 |
| 6.387 | 1.338 |
| 6.388 | 1.34 |
| 6.389 | 1.342 |
| 6.39 | 1.344 |
| 6.391 | 1.346 |
| 6.392 | 1.348 |
| 6.393 | 1.35 |
| 6.394 | 1.352 |
| 6.395 | 1.354 |
| 6.396 | 1.356 |
| 6.397 | 1.358 |
| 6.398 | 1.36 |
| 6.399 | 1.362 |
| 6.4 | 1.363 |
| 6.401 | 1.365 |
| 6.402 | 1.367 |
| 6.403 | 1.369 |
| 6.404 | 1.371 |
| 6.405 | 1.373 |
| 6.406 | 1.375 |
| 6.407 | 1.377 |
| 6.408 | 1.379 |
| 6.409 | 1.381 |
| 6.41 | 1.383 |
| 6.411 | 1.385 |
| 6.412 | 1.387 |
| 6.413 | 1.389 |
| 6.414 | 1.391 |
| 6.415 | 1.393 |
| 6.416 | 1.395 |
| 6.417 | 1.397 |
| 6.418 | 1.399 |
| 6.419 | 1.401 |
| 6.42 | 1.403 |
| 6.421 | 1.405 |
| 6.422 | 1.406 |
| 6.423 | 1.408 |
| 6.424 | 1.41 |
| 6.425 | 1.412 |
| 6.426 | 1.414 |
| 6.427 | 1.416 |
| 6.428 | 1.418 |
| 6.429 | 1.42 |
| 6.43 | 1.422 |
| 6.431 | 1.424 |
| 6.432 | 1.426 |
| 6.433 | 1.428 |
| 6.434 | 1.43 |
| 6.435 | 1.432 |
| 6.436 | 1.434 |
| 6.437 | 1.436 |
| 6.438 | 1.438 |
| 6.439 | 1.44 |
| 6.44 | 1.442 |
| 6.441 | 1.444 |
| 6.442 | 1.446 |
| 6.443 | 1.448 |
| 6.444 | 1.45 |
| 6.445 | 1.452 |
| 6.446 | 1.454 |
| 6.447 | 1.456 |
| 6.448 | 1.458 |
| 6.449 | 1.46 |
| 6.45 | 1.462 |
| 6.451 | 1.464 |
| 6.452 | 1.466 |
| 6.453 | 1.468 |
| 6.454 | 1.47 |
| 6.455 | 1.472 |
| 6.456 | 1.474 |
| 6.457 | 1.476 |
| 6.458 | 1.478 |
| 6.459 | 1.48 |
| 6.46 | 1.482 |
| 6.461 | 1.484 |
| 6.462 | 1.486 |
| 6.463 | 1.488 |
| 6.464 | 1.49 |
| 6.465 | 1.492 |
| 6.466 | 1.494 |
| 6.467 | 1.496 |
| 6.468 | 1.498 |
| 6.469 | 1.5 |
| 6.47 | 1.502 |
| 6.471 | 1.504 |
| 6.472 | 1.506 |
| 6.473 | 1.508 |
| 6.474 | 1.51 |
| 6.475 | 1.512 |
| 6.476 | 1.514 |
| 6.477 | 1.517 |
| 6.478 | 1.519 |
| 6.479 | 1.521 |
| 6.48 | 1.523 |
| 6.481 | 1.525 |
| 6.482 | 1.527 |
| 6.483 | 1.529 |
| 6.484 | 1.531 |
| 6.485 | 1.533 |
| 6.486 | 1.535 |
| 6.487 | 1.537 |
| 6.488 | 1.539 |
| 6.489 | 1.541 |
| 6.49 | 1.543 |
| 6.491 | 1.545 |
| 6.492 | 1.547 |
| 6.493 | 1.549 |
| 6.494 | 1.551 |
| 6.495 | 1.553 |
| 6.496 | 1.555 |
| 6.497 | 1.557 |
| 6.498 | 1.559 |
| 6.499 | 1.562 |
| 6.5 | 1.564 |
| 6.501 | 1.566 |
| 6.502 | 1.568 |
| 6.503 | 1.57 |
| 6.504 | 1.572 |
| 6.505 | 1.574 |
| 6.506 | 1.576 |
| 6.507 | 1.578 |
| 6.508 | 1.581 |
| 6.509 | 1.583 |
| 6.51 | 1.585 |
| 6.511 | 1.587 |
| 6.512 | 1.589 |
| 6.513 | 1.591 |
| 6.514 | 1.593 |
| 6.515 | 1.595 |
| 6.516 | 1.598 |
| 6.517 | 1.6 |
| 6.518 | 1.602 |
| 6.519 | 1.604 |
| 6.52 | 1.606 |
| 6.521 | 1.608 |
| 6.522 | 1.61 |
| 6.523 | 1.612 |
| 6.524 | 1.615 |
| 6.525 | 1.617 |
| 6.526 | 1.619 |
| 6.527 | 1.621 |
| 6.528 | 1.623 |
| 6.529 | 1.625 |
| 6.53 | 1.627 |
| 6.531 | 1.63 |
| 6.532 | 1.632 |
| 6.533 | 1.634 |
| 6.534 | 1.636 |
| 6.535 | 1.638 |
| 6.536 | 1.64 |
| 6.537 | 1.643 |
| 6.538 | 1.645 |
| 6.539 | 1.647 |
| 6.54 | 1.649 |
| 6.541 | 1.651 |
| 6.542 | 1.653 |
| 6.543 | 1.655 |
| 6.544 | 1.658 |
| 6.545 | 1.66 |
| 6.546 | 1.662 |
| 6.547 | 1.664 |
| 6.548 | 1.666 |
| 6.549 | 1.668 |
| 6.55 | 1.671 |
| 6.551 | 1.673 |
| 6.552 | 1.675 |
| 6.553 | 1.677 |
| 6.554 | 1.679 |
| 6.555 | 1.681 |
| 6.556 | 1.684 |
| 6.557 | 1.686 |
| 6.558 | 1.688 |
| 6.559 | 1.69 |
| 6.56 | 1.692 |
| 6.561 | 1.695 |
| 6.562 | 1.697 |
| 6.563 | 1.699 |
| 6.564 | 1.701 |
| 6.565 | 1.703 |
| 6.566 | 1.705 |
| 6.567 | 1.708 |
| 6.568 | 1.71 |
| 6.569 | 1.712 |
| 6.57 | 1.714 |
| 6.571 | 1.716 |
| 6.572 | 1.719 |
| 6.573 | 1.721 |
| 6.574 | 1.723 |
| 6.575 | 1.725 |
| 6.576 | 1.727 |
| 6.577 | 1.73 |
| 6.578 | 1.732 |
| 6.579 | 1.734 |
| 6.58 | 1.736 |
| 6.581 | 1.738 |
| 6.582 | 1.741 |
| 6.583 | 1.743 |
| 6.584 | 1.745 |
| 6.585 | 1.747 |
| 6.586 | 1.749 |
| 6.587 | 1.752 |
| 6.588 | 1.754 |
| 6.589 | 1.756 |
| 6.59 | 1.758 |
| 6.591 | 1.76 |
| 6.592 | 1.763 |
| 6.593 | 1.765 |
| 6.594 | 1.767 |
| 6.595 | 1.769 |
| 6.596 | 1.772 |
| 6.597 | 1.774 |
| 6.598 | 1.776 |
| 6.599 | 1.778 |
| 6.6 | 1.78 |
| 6.601 | 1.783 |
| 6.602 | 1.785 |
| 6.603 | 1.787 |
| 6.604 | 1.789 |
| 6.605 | 1.791 |
| 6.606 | 1.794 |
| 6.607 | 1.796 |
| 6.608 | 1.798 |
| 6.609 | 1.8 |
| 6.61 | 1.803 |
| 6.611 | 1.805 |
| 6.612 | 1.807 |
| 6.613 | 1.809 |
| 6.614 | 1.811 |
| 6.615 | 1.814 |
| 6.616 | 1.816 |
| 6.617 | 1.818 |
| 6.618 | 1.82 |
| 6.619 | 1.823 |
| 6.62 | 1.825 |
| 6.621 | 1.827 |
| 6.622 | 1.829 |
| 6.623 | 1.831 |
| 6.624 | 1.834 |
| 6.625 | 1.836 |
| 6.626 | 1.838 |
| 6.627 | 1.84 |
| 6.628 | 1.843 |
| 6.629 | 1.845 |
| 6.63 | 1.847 |
| 6.631 | 1.849 |
| 6.632 | 1.851 |
| 6.633 | 1.854 |
| 6.634 | 1.856 |
| 6.635 | 1.858 |
| 6.636 | 1.86 |
| 6.637 | 1.863 |
| 6.638 | 1.865 |
| 6.639 | 1.867 |
| 6.64 | 1.869 |
| 6.641 | 1.872 |
| 6.642 | 1.874 |
| 6.643 | 1.876 |
| 6.644 | 1.878 |
| 6.645 | 1.881 |
| 6.646 | 1.883 |
| 6.647 | 1.885 |
| 6.648 | 1.887 |
| 6.649 | 1.89 |
| 6.65 | 1.892 |
| 6.651 | 1.894 |
| 6.652 | 1.896 |
| 6.653 | 1.899 |
| 6.654 | 1.901 |
| 6.655 | 1.903 |
| 6.656 | 1.905 |
| 6.657 | 1.908 |
| 6.658 | 1.91 |
| 6.659 | 1.912 |
| 6.66 | 1.914 |
| 6.661 | 1.917 |
| 6.662 | 1.919 |
| 6.663 | 1.921 |
| 6.664 | 1.924 |
| 6.665 | 1.926 |
| 6.666 | 1.928 |
| 6.667 | 1.93 |
| 6.668 | 1.933 |
| 6.669 | 1.935 |
| 6.67 | 1.937 |
| 6.671 | 1.939 |
| 6.672 | 1.942 |
| 6.673 | 1.944 |
| 6.674 | 1.946 |
| 6.675 | 1.949 |
| 6.676 | 1.951 |
| 6.677 | 1.953 |
| 6.678 | 1.955 |
| 6.679 | 1.958 |
| 6.68 | 1.96 |
| 6.681 | 1.962 |
| 6.682 | 1.965 |
| 6.683 | 1.967 |
| 6.684 | 1.969 |
| 6.685 | 1.971 |
| 6.686 | 1.974 |
| 6.687 | 1.976 |
| 6.688 | 1.978 |
| 6.689 | 1.981 |
| 6.69 | 1.983 |
| 6.691 | 1.985 |
| 6.692 | 1.987 |
| 6.693 | 1.99 |
| 6.694 | 1.992 |
| 6.695 | 1.994 |
| 6.696 | 1.997 |
| 6.697 | 1.999 |
| 6.698 | 2.001 |
| 6.699 | 2.003 |
| 6.7 | 2.006 |
| 6.701 | 2.008 |
| 6.702 | 2.01 |
| 6.703 | 2.013 |
| 6.704 | 2.015 |
| 6.705 | 2.017 |
| 6.706 | 2.02 |
| 6.707 | 2.022 |
| 6.708 | 2.024 |
| 6.709 | 2.027 |
| 6.71 | 2.029 |
| 6.711 | 2.031 |
| 6.712 | 2.033 |
| 6.713 | 2.036 |
| 6.714 | 2.038 |
| 6.715 | 2.04 |
| 6.716 | 2.043 |
| 6.717 | 2.045 |
| 6.718 | 2.047 |
| 6.719 | 2.05 |
| 6.72 | 2.052 |
| 6.721 | 2.054 |
| 6.722 | 2.057 |
| 6.723 | 2.059 |
| 6.724 | 2.061 |
| 6.725 | 2.064 |
| 6.726 | 2.066 |
| 6.727 | 2.068 |
| 6.728 | 2.071 |
| 6.729 | 2.073 |
| 6.73 | 2.075 |
| 6.731 | 2.078 |
| 6.732 | 2.08 |
| 6.733 | 2.082 |
| 6.734 | 2.085 |
| 6.735 | 2.087 |
| 6.736 | 2.089 |
| 6.737 | 2.092 |
| 6.738 | 2.094 |
| 6.739 | 2.096 |
| 6.74 | 2.099 |
| 6.741 | 2.101 |
| 6.742 | 2.103 |
| 6.743 | 2.106 |
| 6.744 | 2.108 |
| 6.745 | 2.11 |
| 6.746 | 2.113 |
| 6.747 | 2.115 |
| 6.748 | 2.117 |
| 6.749 | 2.12 |
| 6.75 | 2.122 |
| 6.751 | 2.125 |
| 6.752 | 2.127 |
| 6.753 | 2.129 |
| 6.754 | 2.132 |
| 6.755 | 2.134 |
| 6.756 | 2.136 |
| 6.757 | 2.139 |
| 6.758 | 2.141 |
| 6.759 | 2.143 |
| 6.76 | 2.146 |
| 6.761 | 2.148 |
| 6.762 | 2.15 |
| 6.763 | 2.153 |
| 6.764 | 2.155 |
| 6.765 | 2.158 |
| 6.766 | 2.16 |
| 6.767 | 2.162 |
| 6.768 | 2.165 |
| 6.769 | 2.167 |
| 6.77 | 2.169 |
| 6.771 | 2.172 |
| 6.772 | 2.174 |
| 6.773 | 2.177 |
| 6.774 | 2.179 |
| 6.775 | 2.181 |
| 6.776 | 2.184 |
| 6.777 | 2.186 |
| 6.778 | 2.188 |
| 6.779 | 2.191 |
| 6.78 | 2.193 |
| 6.781 | 2.196 |
| 6.782 | 2.198 |
| 6.783 | 2.2 |
| 6.784 | 2.203 |
| 6.785 | 2.205 |
| 6.786 | 2.207 |
| 6.787 | 2.21 |
| 6.788 | 2.212 |
| 6.789 | 2.215 |
| 6.79 | 2.217 |
| 6.791 | 2.219 |
| 6.792 | 2.222 |
| 6.793 | 2.224 |
| 6.794 | 2.227 |
| 6.795 | 2.229 |
| 6.796 | 2.231 |
| 6.797 | 2.234 |
| 6.798 | 2.236 |
| 6.799 | 2.239 |
| 6.8 | 2.241 |
| 6.801 | 2.243 |
| 6.802 | 2.246 |
| 6.803 | 2.248 |
| 6.804 | 2.251 |
| 6.805 | 2.253 |
| 6.806 | 2.255 |
| 6.807 | 2.258 |
| 6.808 | 2.26 |
| 6.809 | 2.263 |
| 6.81 | 2.265 |
| 6.811 | 2.267 |
| 6.812 | 2.27 |
| 6.813 | 2.272 |
| 6.814 | 2.275 |
| 6.815 | 2.277 |
| 6.816 | 2.279 |
| 6.817 | 2.282 |
| 6.818 | 2.284 |
| 6.819 | 2.287 |
| 6.82 | 2.289 |
| 6.821 | 2.291 |
| 6.822 | 2.294 |
| 6.823 | 2.296 |
| 6.824 | 2.299 |
| 6.825 | 2.301 |
| 6.826 | 2.303 |
| 6.827 | 2.306 |
| 6.828 | 2.308 |
| 6.829 | 2.311 |
| 6.83 | 2.313 |
| 6.831 | 2.316 |
| 6.832 | 2.318 |
| 6.833 | 2.32 |
| 6.834 | 2.323 |
| 6.835 | 2.325 |
| 6.836 | 2.328 |
| 6.837 | 2.33 |
| 6.838 | 2.333 |
| 6.839 | 2.335 |
| 6.84 | 2.337 |
| 6.841 | 2.34 |
| 6.842 | 2.342 |
| 6.843 | 2.345 |
| 6.844 | 2.347 |
| 6.845 | 2.35 |
| 6.846 | 2.352 |
| 6.847 | 2.354 |
| 6.848 | 2.357 |
| 6.849 | 2.359 |
| 6.85 | 2.362 |
| 6.851 | 2.364 |
| 6.852 | 2.367 |
| 6.853 | 2.369 |
| 6.854 | 2.371 |
| 6.855 | 2.374 |
| 6.856 | 2.376 |
| 6.857 | 2.379 |
| 6.858 | 2.381 |
| 6.859 | 2.384 |
| 6.86 | 2.386 |
| 6.861 | 2.388 |
| 6.862 | 2.391 |
| 6.863 | 2.393 |
| 6.864 | 2.396 |
| 6.865 | 2.398 |
| 6.866 | 2.401 |
| 6.867 | 2.403 |
| 6.868 | 2.406 |
| 6.869 | 2.408 |
| 6.87 | 2.41 |
| 6.871 | 2.413 |
| 6.872 | 2.415 |
| 6.873 | 2.418 |
| 6.874 | 2.42 |
| 6.875 | 2.423 |
| 6.876 | 2.425 |
| 6.877 | 2.428 |
| 6.878 | 2.43 |
| 6.879 | 2.433 |
| 6.88 | 2.435 |
| 6.881 | 2.437 |
| 6.882 | 2.44 |
| 6.883 | 2.442 |
| 6.884 | 2.445 |
| 6.885 | 2.447 |
| 6.886 | 2.45 |
| 6.887 | 2.452 |
| 6.888 | 2.455 |
| 6.889 | 2.457 |
| 6.89 | 2.46 |
| 6.891 | 2.462 |
| 6.892 | 2.464 |
| 6.893 | 2.467 |
| 6.894 | 2.469 |
| 6.895 | 2.472 |
| 6.896 | 2.474 |
| 6.897 | 2.477 |
| 6.898 | 2.479 |
| 6.899 | 2.482 |
| 6.9 | 2.484 |
| 6.901 | 2.487 |
| 6.902 | 2.489 |
| 6.903 | 2.492 |
| 6.904 | 2.494 |
| 6.905 | 2.497 |
| 6.906 | 2.499 |
| 6.907 | 2.502 |
| 6.908 | 2.504 |
| 6.909 | 2.506 |
| 6.91 | 2.509 |
| 6.911 | 2.511 |
| 6.912 | 2.514 |
| 6.913 | 2.516 |
| 6.914 | 2.519 |
| 6.915 | 2.521 |
| 6.916 | 2.524 |
| 6.917 | 2.526 |
| 6.918 | 2.529 |
| 6.919 | 2.531 |
| 6.92 | 2.534 |
| 6.921 | 2.536 |
| 6.922 | 2.539 |
| 6.923 | 2.541 |
| 6.924 | 2.544 |
| 6.925 | 2.546 |
| 6.926 | 2.549 |
| 6.927 | 2.551 |
| 6.928 | 2.554 |
| 6.929 | 2.556 |
| 6.93 | 2.559 |
| 6.931 | 2.561 |
| 6.932 | 2.564 |
| 6.933 | 2.566 |
| 6.934 | 2.568 |
| 6.935 | 2.571 |
| 6.936 | 2.573 |
| 6.937 | 2.576 |
| 6.938 | 2.578 |
| 6.939 | 2.581 |
| 6.94 | 2.583 |
| 6.941 | 2.586 |
| 6.942 | 2.588 |
| 6.943 | 2.591 |
| 6.944 | 2.593 |
| 6.945 | 2.596 |
| 6.946 | 2.598 |
| 6.947 | 2.601 |
| 6.948 | 2.603 |
| 6.949 | 2.606 |
| 6.95 | 2.608 |
| 6.951 | 2.611 |
| 6.952 | 2.613 |
| 6.953 | 2.616 |
| 6.954 | 2.618 |
| 6.955 | 2.621 |
| 6.956 | 2.623 |
| 6.957 | 2.626 |
| 6.958 | 2.628 |
| 6.959 | 2.631 |
| 6.96 | 2.633 |
| 6.961 | 2.636 |
| 6.962 | 2.638 |
| 6.963 | 2.641 |
| 6.964 | 2.643 |
| 6.965 | 2.646 |
| 6.966 | 2.649 |
| 6.967 | 2.651 |
| 6.968 | 2.654 |
| 6.969 | 2.656 |
| 6.97 | 2.659 |
| 6.971 | 2.661 |
| 6.972 | 2.664 |
| 6.973 | 2.666 |
| 6.974 | 2.669 |
| 6.975 | 2.671 |
| 6.976 | 2.674 |
| 6.977 | 2.676 |
| 6.978 | 2.679 |
| 6.979 | 2.681 |
| 6.98 | 2.684 |
| 6.981 | 2.686 |
| 6.982 | 2.689 |
| 6.983 | 2.692 |
| 6.984 | 2.694 |
| 6.985 | 2.697 |
| 6.986 | 2.699 |
| 6.987 | 2.702 |
| 6.988 | 2.704 |
| 6.989 | 2.707 |
| 6.99 | 2.709 |
| 6.991 | 2.712 |
| 6.992 | 2.714 |
| 6.993 | 2.717 |
| 6.994 | 2.72 |
| 6.995 | 2.722 |
| 6.996 | 2.725 |
| 6.997 | 2.727 |
| 6.998 | 2.73 |
| 6.999 | 2.732 |
| 7.0 | 2.735 |
| 7.001 | 2.737 |
| 7.002 | 2.74 |
| 7.003 | 2.742 |
| 7.004 | 2.745 |
| 7.005 | 2.747 |
| 7.006 | 2.75 |
| 7.007 | 2.752 |
| 7.008 | 2.755 |
| 7.009 | 2.758 |
| 7.01 | 2.76 |
| 7.011 | 2.763 |
| 7.012 | 2.765 |
| 7.013 | 2.768 |
| 7.014 | 2.77 |
| 7.015 | 2.773 |
| 7.016 | 2.775 |
| 7.017 | 2.778 |
| 7.018 | 2.78 |
| 7.019 | 2.783 |
| 7.02 | 2.785 |
| 7.021 | 2.788 |
| 7.022 | 2.791 |
| 7.023 | 2.793 |
| 7.024 | 2.796 |
| 7.025 | 2.798 |
| 7.026 | 2.801 |
| 7.027 | 2.803 |
| 7.028 | 2.806 |
| 7.029 | 2.808 |
| 7.03 | 2.811 |
| 7.031 | 2.813 |
| 7.032 | 2.816 |
| 7.033 | 2.818 |
| 7.034 | 2.821 |
| 7.035 | 2.824 |
| 7.036 | 2.826 |
| 7.037 | 2.829 |
| 7.038 | 2.831 |
| 7.039 | 2.834 |
| 7.04 | 2.836 |
| 7.041 | 2.839 |
| 7.042 | 2.841 |
| 7.043 | 2.844 |
| 7.044 | 2.846 |
| 7.045 | 2.849 |
| 7.046 | 2.852 |
| 7.047 | 2.854 |
| 7.048 | 2.857 |
| 7.049 | 2.859 |
| 7.05 | 2.862 |
| 7.051 | 2.864 |
| 7.052 | 2.867 |
| 7.053 | 2.869 |
| 7.054 | 2.872 |
| 7.055 | 2.875 |
| 7.056 | 2.877 |
| 7.057 | 2.88 |
| 7.058 | 2.882 |
| 7.059 | 2.885 |
| 7.06 | 2.887 |
| 7.061 | 2.89 |
| 7.062 | 2.892 |
| 7.063 | 2.895 |
| 7.064 | 2.898 |
| 7.065 | 2.9 |
| 7.066 | 2.903 |
| 7.067 | 2.905 |
| 7.068 | 2.908 |
| 7.069 | 2.91 |
| 7.07 | 2.913 |
| 7.071 | 2.916 |
| 7.072 | 2.918 |
| 7.073 | 2.921 |
| 7.074 | 2.923 |
| 7.075 | 2.926 |
| 7.076 | 2.928 |
| 7.077 | 2.931 |
| 7.078 | 2.933 |
| 7.079 | 2.936 |
| 7.08 | 2.939 |
| 7.081 | 2.941 |
| 7.082 | 2.944 |
| 7.083 | 2.946 |
| 7.084 | 2.949 |
| 7.085 | 2.951 |
| 7.086 | 2.954 |
| 7.087 | 2.957 |
| 7.088 | 2.959 |
| 7.089 | 2.962 |
| 7.09 | 2.964 |
| 7.091 | 2.967 |
| 7.092 | 2.969 |
| 7.093 | 2.972 |
| 7.094 | 2.975 |
| 7.095 | 2.977 |
| 7.096 | 2.98 |
| 7.097 | 2.982 |
| 7.098 | 2.985 |
| 7.099 | 2.987 |
| 7.1 | 2.99 |
| 7.101 | 2.993 |
| 7.102 | 2.995 |
| 7.103 | 2.998 |
| 7.104 | 3 |
| 7.105 | 3.003 |
| 7.106 | 3.006 |
| 7.107 | 3.008 |
| 7.108 | 3.011 |
| 7.109 | 3.013 |
| 7.11 | 3.016 |
| 7.111 | 3.018 |
| 7.112 | 3.021 |
| 7.113 | 3.024 |
| 7.114 | 3.026 |
| 7.115 | 3.029 |
| 7.116 | 3.031 |
| 7.117 | 3.034 |
| 7.118 | 3.036 |
| 7.119 | 3.039 |
| 7.12 | 3.042 |
| 7.121 | 3.044 |
| 7.122 | 3.047 |
| 7.123 | 3.049 |
| 7.124 | 3.052 |
| 7.125 | 3.055 |
| 7.126 | 3.057 |
| 7.127 | 3.06 |
| 7.128 | 3.062 |
| 7.129 | 3.065 |
| 7.13 | 3.068 |
| 7.131 | 3.07 |
| 7.132 | 3.073 |
| 7.133 | 3.075 |
| 7.134 | 3.078 |
| 7.135 | 3.08 |
| 7.136 | 3.083 |
| 7.137 | 3.086 |
| 7.138 | 3.088 |
| 7.139 | 3.091 |
| 7.14 | 3.093 |
| 7.141 | 3.096 |
| 7.142 | 3.099 |
| 7.143 | 3.101 |
| 7.144 | 3.104 |
| 7.145 | 3.106 |
| 7.146 | 3.109 |
| 7.147 | 3.112 |
| 7.148 | 3.114 |
| 7.149 | 3.117 |
| 7.15 | 3.119 |
| 7.151 | 3.122 |
| 7.152 | 3.125 |
| 7.153 | 3.127 |
| 7.154 | 3.13 |
| 7.155 | 3.132 |
| 7.156 | 3.135 |
| 7.157 | 3.138 |
| 7.158 | 3.14 |
| 7.159 | 3.143 |
| 7.16 | 3.145 |
| 7.161 | 3.148 |
| 7.162 | 3.151 |
| 7.163 | 3.153 |
| 7.164 | 3.156 |
| 7.165 | 3.158 |
| 7.166 | 3.161 |
| 7.167 | 3.164 |
| 7.168 | 3.166 |
| 7.169 | 3.169 |
| 7.17 | 3.171 |
| 7.171 | 3.174 |
| 7.172 | 3.177 |
| 7.173 | 3.179 |
| 7.174 | 3.182 |
| 7.175 | 3.184 |
| 7.176 | 3.187 |
| 7.177 | 3.19 |
| 7.178 | 3.192 |
| 7.179 | 3.195 |
| 7.18 | 3.197 |
| 7.181 | 3.2 |
| 7.182 | 3.203 |
| 7.183 | 3.205 |
| 7.184 | 3.208 |
| 7.185 | 3.211 |
| 7.186 | 3.213 |
| 7.187 | 3.216 |
| 7.188 | 3.218 |
| 7.189 | 3.221 |
| 7.19 | 3.224 |
| 7.191 | 3.226 |
| 7.192 | 3.229 |
| 7.193 | 3.231 |
| 7.194 | 3.234 |
| 7.195 | 3.237 |
| 7.196 | 3.239 |
| 7.197 | 3.242 |
| 7.198 | 3.244 |
| 7.199 | 3.247 |
| 7.2 | 3.25 |
| 7.201 | 3.252 |
| 7.202 | 3.255 |
| 7.203 | 3.258 |
| 7.204 | 3.26 |
| 7.205 | 3.263 |
| 7.206 | 3.265 |
| 7.207 | 3.268 |
| 7.208 | 3.271 |
| 7.209 | 3.273 |
| 7.21 | 3.276 |
| 7.211 | 3.279 |
| 7.212 | 3.281 |
| 7.213 | 3.284 |
| 7.214 | 3.286 |
| 7.215 | 3.289 |
| 7.216 | 3.292 |
| 7.217 | 3.294 |
| 7.218 | 3.297 |
| 7.219 | 3.3 |
| 7.22 | 3.302 |
| 7.221 | 3.305 |
| 7.222 | 3.307 |
| 7.223 | 3.31 |
| 7.224 | 3.313 |
| 7.225 | 3.315 |
| 7.226 | 3.318 |
| 7.227 | 3.321 |
| 7.228 | 3.323 |
| 7.229 | 3.326 |
| 7.23 | 3.328 |
| 7.231 | 3.331 |
| 7.232 | 3.334 |
| 7.233 | 3.336 |
| 7.234 | 3.339 |
| 7.235 | 3.342 |
| 7.236 | 3.344 |
| 7.237 | 3.347 |
| 7.238 | 3.349 |
| 7.239 | 3.352 |
| 7.24 | 3.355 |
| 7.241 | 3.357 |
| 7.242 | 3.36 |
| 7.243 | 3.363 |
| 7.244 | 3.365 |
| 7.245 | 3.368 |
| 7.246 | 3.371 |
| 7.247 | 3.373 |
| 7.248 | 3.376 |
| 7.249 | 3.378 |
| 7.25 | 3.381 |
| 7.251 | 3.384 |
| 7.252 | 3.386 |
| 7.253 | 3.389 |
| 7.254 | 3.392 |
| 7.255 | 3.394 |
| 7.256 | 3.397 |
| 7.257 | 3.4 |
| 7.258 | 3.402 |
| 7.259 | 3.405 |
| 7.26 | 3.407 |
| 7.261 | 3.41 |
| 7.262 | 3.413 |
| 7.263 | 3.415 |
| 7.264 | 3.418 |
| 7.265 | 3.421 |
| 7.266 | 3.423 |
| 7.267 | 3.426 |
| 7.268 | 3.429 |
| 7.269 | 3.431 |
| 7.27 | 3.434 |
| 7.271 | 3.437 |
| 7.272 | 3.439 |
| 7.273 | 3.442 |
| 7.274 | 3.444 |
| 7.275 | 3.447 |
| 7.276 | 3.45 |
| 7.277 | 3.452 |
| 7.278 | 3.455 |
| 7.279 | 3.458 |
| 7.28 | 3.46 |
| 7.281 | 3.463 |
| 7.282 | 3.466 |
| 7.283 | 3.468 |
| 7.284 | 3.471 |
| 7.285 | 3.474 |
| 7.286 | 3.476 |
| 7.287 | 3.479 |
| 7.288 | 3.481 |
| 7.289 | 3.484 |
| 7.29 | 3.487 |
| 7.291 | 3.489 |
| 7.292 | 3.492 |
| 7.293 | 3.495 |
| 7.294 | 3.497 |
| 7.295 | 3.5 |
| 7.296 | 3.503 |
| 7.297 | 3.505 |
| 7.298 | 3.508 |
| 7.299 | 3.511 |
| 7.3 | 3.513 |
| 7.301 | 3.516 |
| 7.302 | 3.519 |
| 7.303 | 3.521 |
| 7.304 | 3.524 |
| 7.305 | 3.527 |
| 7.306 | 3.529 |
| 7.307 | 3.532 |
| 7.308 | 3.534 |
| 7.309 | 3.537 |
| 7.31 | 3.54 |
| 7.311 | 3.542 |
| 7.312 | 3.545 |
| 7.313 | 3.548 |
| 7.314 | 3.55 |
| 7.315 | 3.553 |
| 7.316 | 3.556 |
| 7.317 | 3.558 |
| 7.318 | 3.561 |
| 7.319 | 3.564 |
| 7.32 | 3.566 |
| 7.321 | 3.569 |
| 7.322 | 3.572 |
| 7.323 | 3.574 |
| 7.324 | 3.577 |
| 7.325 | 3.58 |
| 7.326 | 3.582 |
| 7.327 | 3.585 |
| 7.328 | 3.588 |
| 7.329 | 3.59 |
| 7.33 | 3.593 |
| 7.331 | 3.596 |
| 7.332 | 3.598 |
| 7.333 | 3.601 |
| 7.334 | 3.604 |
| 7.335 | 3.606 |
| 7.336 | 3.609 |
| 7.337 | 3.611 |
| 7.338 | 3.614 |
| 7.339 | 3.617 |
| 7.34 | 3.619 |
| 7.341 | 3.622 |
| 7.342 | 3.625 |
| 7.343 | 3.627 |
| 7.344 | 3.63 |
| 7.345 | 3.633 |
| 7.346 | 3.635 |
| 7.347 | 3.638 |
| 7.348 | 3.641 |
| 7.349 | 3.643 |
| 7.35 | 3.646 |
| 7.351 | 3.649 |
| 7.352 | 3.651 |
| 7.353 | 3.654 |
| 7.354 | 3.657 |
| 7.355 | 3.659 |
| 7.356 | 3.662 |
| 7.357 | 3.665 |
| 7.358 | 3.667 |
| 7.359 | 3.67 |
| 7.36 | 3.673 |
| 7.361 | 3.675 |
| 7.362 | 3.678 |
| 7.363 | 3.681 |
| 7.364 | 3.683 |
| 7.365 | 3.686 |
| 7.366 | 3.689 |
| 7.367 | 3.691 |
| 7.368 | 3.694 |
| 7.369 | 3.697 |
| 7.37 | 3.699 |
| 7.371 | 3.702 |
| 7.372 | 3.705 |
| 7.373 | 3.707 |
| 7.374 | 3.71 |
| 7.375 | 3.713 |
| 7.376 | 3.715 |
| 7.377 | 3.718 |
| 7.378 | 3.721 |
| 7.379 | 3.723 |
| 7.38 | 3.726 |
| 7.381 | 3.729 |
| 7.382 | 3.731 |
| 7.383 | 3.734 |
| 7.384 | 3.737 |
| 7.385 | 3.739 |
| 7.386 | 3.742 |
| 7.387 | 3.745 |
| 7.388 | 3.747 |
| 7.389 | 3.75 |
| 7.39 | 3.753 |
| 7.391 | 3.755 |
| 7.392 | 3.758 |
| 7.393 | 3.761 |
| 7.394 | 3.763 |
| 7.395 | 3.766 |
| 7.396 | 3.769 |
| 7.397 | 3.771 |
| 7.398 | 3.774 |
| 7.399 | 3.777 |
| 7.4 | 3.779 |
| 7.401 | 3.782 |
| 7.402 | 3.785 |
| 7.403 | 3.787 |
| 7.404 | 3.79 |
| 7.405 | 3.793 |
| 7.406 | 3.795 |
| 7.407 | 3.798 |
| 7.408 | 3.801 |
| 7.409 | 3.803 |
| 7.41 | 3.806 |
| 7.411 | 3.809 |
| 7.412 | 3.812 |
| 7.413 | 3.814 |
| 7.414 | 3.817 |
| 7.415 | 3.82 |
| 7.416 | 3.822 |
| 7.417 | 3.825 |
| 7.418 | 3.828 |
| 7.419 | 3.83 |
| 7.42 | 3.833 |
| 7.421 | 3.836 |
| 7.422 | 3.838 |
| 7.423 | 3.841 |
| 7.424 | 3.844 |
| 7.425 | 3.846 |
| 7.426 | 3.849 |
| 7.427 | 3.852 |
| 7.428 | 3.854 |
| 7.429 | 3.857 |
| 7.43 | 3.86 |
| 7.431 | 3.862 |
| 7.432 | 3.865 |
| 7.433 | 3.868 |
| 7.434 | 3.87 |
| 7.435 | 3.873 |
| 7.436 | 3.876 |
| 7.437 | 3.878 |
| 7.438 | 3.881 |
| 7.439 | 3.884 |
| 7.44 | 3.886 |
| 7.441 | 3.889 |
| 7.442 | 3.892 |
| 7.443 | 3.894 |
| 7.444 | 3.897 |
| 7.445 | 3.9 |
| 7.446 | 3.903 |
| 7.447 | 3.905 |
| 7.448 | 3.908 |
| 7.449 | 3.911 |
| 7.45 | 3.913 |
| 7.451 | 3.916 |
| 7.452 | 3.919 |
| 7.453 | 3.921 |
| 7.454 | 3.924 |
| 7.455 | 3.927 |
| 7.456 | 3.929 |
| 7.457 | 3.932 |
| 7.458 | 3.935 |
| 7.459 | 3.937 |
| 7.46 | 3.94 |
| 7.461 | 3.943 |
| 7.462 | 3.945 |
| 7.463 | 3.948 |
| 7.464 | 3.951 |
| 7.465 | 3.953 |
| 7.466 | 3.956 |
| 7.467 | 3.959 |
| 7.468 | 3.961 |
| 7.469 | 3.964 |
| 7.47 | 3.967 |
| 7.471 | 3.97 |
| 7.472 | 3.972 |
| 7.473 | 3.975 |
| 7.474 | 3.978 |
| 7.475 | 3.98 |
| 7.476 | 3.983 |
| 7.477 | 3.986 |
| 7.478 | 3.988 |
| 7.479 | 3.991 |
| 7.48 | 3.994 |
| 7.481 | 3.996 |
| 7.482 | 3.999 |
| 7.483 | 4.002 |
| 7.484 | 4.004 |
| 7.485 | 4.007 |
| 7.486 | 4.01 |
| 7.487 | 4.012 |
| 7.488 | 4.015 |
| 7.489 | 4.018 |
| 7.49 | 4.021 |
| 7.491 | 4.023 |
| 7.492 | 4.026 |
| 7.493 | 4.029 |
| 7.494 | 4.031 |
| 7.495 | 4.034 |
| 7.496 | 4.037 |
| 7.497 | 4.039 |
| 7.498 | 4.042 |
| 7.499 | 4.045 |
| 7.5 | 4.047 |